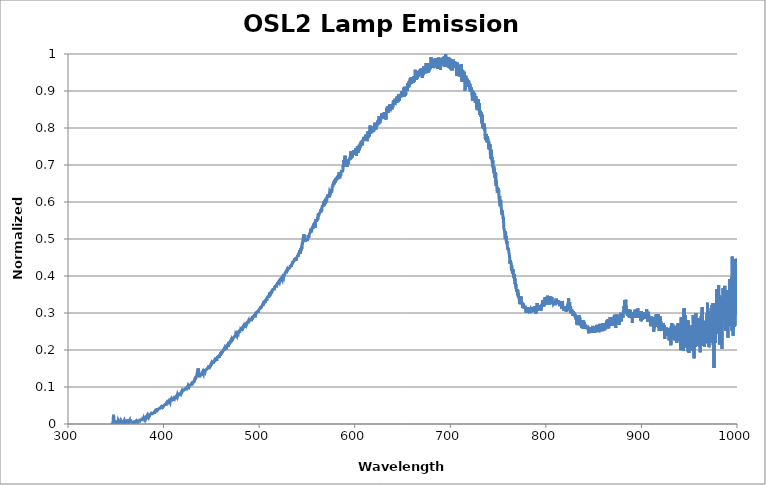
| Category | OSL2 Lamp Emission Spectrum |
|---|---|
| 344.85 | 0 |
| 345.06 | 0 |
| 345.28 | 0 |
| 345.49 | 0 |
| 345.71 | 0 |
| 345.92 | 0 |
| 346.14 | 0 |
| 346.35 | 0 |
| 346.56 | 0 |
| 346.78 | 0 |
| 346.99 | 0 |
| 347.21 | 0 |
| 347.42 | 0 |
| 347.64 | 0.025 |
| 347.85 | 0.026 |
| 348.07 | 0.007 |
| 348.28 | 0.004 |
| 348.49 | 0.01 |
| 348.71 | 0.001 |
| 348.92 | 0.003 |
| 349.14 | 0.003 |
| 349.35 | 0.007 |
| 349.57 | 0.002 |
| 349.78 | 0.006 |
| 350.0 | 0.005 |
| 350.21 | 0.002 |
| 350.42 | 0.007 |
| 350.64 | 0.005 |
| 350.85 | 0.003 |
| 351.07 | 0 |
| 351.28 | 0.006 |
| 351.5 | 0.008 |
| 351.71 | 0.008 |
| 351.93 | 0.007 |
| 352.14 | 0.005 |
| 352.35 | 0.005 |
| 352.57 | 0.009 |
| 352.78 | 0.008 |
| 353.0 | 0.01 |
| 353.21 | 0.009 |
| 353.43 | 0.004 |
| 353.64 | 0.009 |
| 353.85 | 0.007 |
| 354.07 | 0.006 |
| 354.28 | 0.005 |
| 354.5 | 0.005 |
| 354.71 | 0.009 |
| 354.93 | 0.007 |
| 355.14 | 0.006 |
| 355.35 | 0.006 |
| 355.57 | 0.002 |
| 355.78 | 0.006 |
| 356.0 | 0.008 |
| 356.21 | 0.006 |
| 356.42 | 0.003 |
| 356.64 | 0.005 |
| 356.85 | 0.006 |
| 357.07 | 0.006 |
| 357.28 | 0.006 |
| 357.5 | 0.006 |
| 357.71 | 0.004 |
| 357.92 | 0.005 |
| 358.14 | 0.004 |
| 358.35 | 0.006 |
| 358.57 | 0.003 |
| 358.78 | 0.007 |
| 358.99 | 0.01 |
| 359.21 | 0.008 |
| 359.42 | 0.01 |
| 359.64 | 0.005 |
| 359.85 | 0.003 |
| 360.06 | 0.006 |
| 360.28 | 0.004 |
| 360.49 | 0.001 |
| 360.71 | 0.002 |
| 360.92 | 0.004 |
| 361.13 | 0.004 |
| 361.35 | 0.007 |
| 361.56 | 0.002 |
| 361.78 | 0.009 |
| 361.99 | 0.011 |
| 362.2 | 0.005 |
| 362.42 | 0.012 |
| 362.63 | 0.001 |
| 362.85 | 0.009 |
| 363.06 | 0.006 |
| 363.27 | 0.009 |
| 363.49 | 0.006 |
| 363.7 | 0.007 |
| 363.92 | 0.006 |
| 364.13 | 0.005 |
| 364.34 | 0.01 |
| 364.56 | 0.003 |
| 364.77 | 0.007 |
| 364.98 | 0.007 |
| 365.2 | 0.006 |
| 365.41 | 0.005 |
| 365.63 | 0.008 |
| 365.84 | 0.008 |
| 366.05 | 0.006 |
| 366.27 | 0.006 |
| 366.48 | 0.003 |
| 366.69 | 0.007 |
| 366.91 | 0.006 |
| 367.12 | 0.004 |
| 367.34 | 0.003 |
| 367.55 | 0.003 |
| 367.76 | 0.006 |
| 367.98 | 0.004 |
| 368.19 | 0.004 |
| 368.4 | 0.008 |
| 368.62 | 0.001 |
| 368.83 | 0.005 |
| 369.04 | 0.006 |
| 369.26 | 0.005 |
| 369.47 | 0.003 |
| 369.69 | 0.003 |
| 369.9 | 0.006 |
| 370.11 | 0.008 |
| 370.33 | 0.01 |
| 370.54 | 0.006 |
| 370.75 | 0.004 |
| 370.97 | 0.005 |
| 371.18 | 0.008 |
| 371.39 | 0.003 |
| 371.61 | 0.009 |
| 371.82 | 0.007 |
| 372.04 | 0.009 |
| 372.25 | 0.008 |
| 372.46 | 0.008 |
| 372.68 | 0.005 |
| 372.89 | 0.008 |
| 373.1 | 0.009 |
| 373.32 | 0.008 |
| 373.53 | 0.008 |
| 373.74 | 0.009 |
| 373.96 | 0.008 |
| 374.17 | 0.01 |
| 374.38 | 0.009 |
| 374.6 | 0.008 |
| 374.81 | 0.009 |
| 375.02 | 0.008 |
| 375.24 | 0.011 |
| 375.45 | 0.01 |
| 375.66 | 0.009 |
| 375.88 | 0.009 |
| 376.09 | 0.011 |
| 376.3 | 0.011 |
| 376.52 | 0.009 |
| 376.73 | 0.011 |
| 376.94 | 0.011 |
| 377.16 | 0.01 |
| 377.37 | 0.012 |
| 377.58 | 0.008 |
| 377.8 | 0.011 |
| 378.01 | 0.012 |
| 378.22 | 0.015 |
| 378.44 | 0.015 |
| 378.65 | 0.013 |
| 378.86 | 0.012 |
| 379.08 | 0.015 |
| 379.29 | 0.013 |
| 379.5 | 0.016 |
| 379.72 | 0.016 |
| 379.93 | 0.014 |
| 380.14 | 0.013 |
| 380.36 | 0.018 |
| 380.57 | 0.015 |
| 380.78 | 0.015 |
| 380.99 | 0.017 |
| 381.21 | 0.015 |
| 381.42 | 0.018 |
| 381.63 | 0.019 |
| 381.85 | 0.018 |
| 382.06 | 0.017 |
| 382.27 | 0.02 |
| 382.49 | 0.022 |
| 382.7 | 0.018 |
| 382.91 | 0.016 |
| 383.13 | 0.018 |
| 383.34 | 0.018 |
| 383.55 | 0.021 |
| 383.76 | 0.023 |
| 383.98 | 0.025 |
| 384.19 | 0.021 |
| 384.4 | 0.019 |
| 384.62 | 0.019 |
| 384.83 | 0.022 |
| 385.04 | 0.019 |
| 385.26 | 0.023 |
| 385.47 | 0.025 |
| 385.68 | 0.025 |
| 385.89 | 0.025 |
| 386.11 | 0.026 |
| 386.32 | 0.025 |
| 386.53 | 0.023 |
| 386.75 | 0.025 |
| 386.96 | 0.025 |
| 387.17 | 0.029 |
| 387.38 | 0.027 |
| 387.6 | 0.031 |
| 387.81 | 0.029 |
| 388.02 | 0.029 |
| 388.24 | 0.028 |
| 388.45 | 0.03 |
| 388.66 | 0.03 |
| 388.87 | 0.03 |
| 389.09 | 0.028 |
| 389.3 | 0.029 |
| 389.51 | 0.031 |
| 389.73 | 0.03 |
| 389.94 | 0.031 |
| 390.15 | 0.031 |
| 390.36 | 0.033 |
| 390.58 | 0.028 |
| 390.79 | 0.032 |
| 391.0 | 0.034 |
| 391.21 | 0.034 |
| 391.43 | 0.031 |
| 391.64 | 0.034 |
| 391.85 | 0.035 |
| 392.07 | 0.035 |
| 392.28 | 0.036 |
| 392.49 | 0.037 |
| 392.7 | 0.036 |
| 392.92 | 0.035 |
| 393.13 | 0.039 |
| 393.34 | 0.039 |
| 393.55 | 0.038 |
| 393.77 | 0.037 |
| 393.98 | 0.037 |
| 394.19 | 0.039 |
| 394.4 | 0.038 |
| 394.62 | 0.039 |
| 394.83 | 0.039 |
| 395.04 | 0.039 |
| 395.25 | 0.042 |
| 395.47 | 0.042 |
| 395.68 | 0.042 |
| 395.89 | 0.043 |
| 396.1 | 0.043 |
| 396.32 | 0.042 |
| 396.53 | 0.043 |
| 396.74 | 0.043 |
| 396.95 | 0.043 |
| 397.17 | 0.046 |
| 397.38 | 0.045 |
| 397.59 | 0.046 |
| 397.8 | 0.046 |
| 398.02 | 0.043 |
| 398.23 | 0.044 |
| 398.44 | 0.047 |
| 398.65 | 0.045 |
| 398.87 | 0.046 |
| 399.08 | 0.047 |
| 399.29 | 0.046 |
| 399.5 | 0.046 |
| 399.71 | 0.048 |
| 399.93 | 0.047 |
| 400.14 | 0.049 |
| 400.35 | 0.049 |
| 400.56 | 0.05 |
| 400.78 | 0.05 |
| 400.99 | 0.051 |
| 401.2 | 0.052 |
| 401.41 | 0.052 |
| 401.63 | 0.052 |
| 401.84 | 0.053 |
| 402.05 | 0.053 |
| 402.26 | 0.052 |
| 402.47 | 0.052 |
| 402.69 | 0.052 |
| 402.9 | 0.057 |
| 403.11 | 0.055 |
| 403.32 | 0.056 |
| 403.53 | 0.056 |
| 403.75 | 0.057 |
| 403.96 | 0.059 |
| 404.17 | 0.06 |
| 404.38 | 0.06 |
| 404.6 | 0.059 |
| 404.81 | 0.065 |
| 405.02 | 0.06 |
| 405.23 | 0.062 |
| 405.44 | 0.062 |
| 405.66 | 0.063 |
| 405.87 | 0.062 |
| 406.08 | 0.062 |
| 406.29 | 0.06 |
| 406.5 | 0.062 |
| 406.72 | 0.058 |
| 406.93 | 0.062 |
| 407.14 | 0.064 |
| 407.35 | 0.062 |
| 407.56 | 0.066 |
| 407.78 | 0.061 |
| 407.99 | 0.062 |
| 408.2 | 0.064 |
| 408.41 | 0.064 |
| 408.62 | 0.064 |
| 408.84 | 0.066 |
| 409.05 | 0.066 |
| 409.26 | 0.066 |
| 409.47 | 0.065 |
| 409.68 | 0.067 |
| 409.89 | 0.066 |
| 410.11 | 0.069 |
| 410.32 | 0.07 |
| 410.53 | 0.069 |
| 410.74 | 0.069 |
| 410.95 | 0.068 |
| 411.17 | 0.067 |
| 411.38 | 0.069 |
| 411.59 | 0.072 |
| 411.8 | 0.069 |
| 412.01 | 0.069 |
| 412.22 | 0.072 |
| 412.44 | 0.073 |
| 412.65 | 0.071 |
| 412.86 | 0.073 |
| 413.07 | 0.072 |
| 413.28 | 0.075 |
| 413.49 | 0.078 |
| 413.71 | 0.073 |
| 413.92 | 0.074 |
| 414.13 | 0.076 |
| 414.34 | 0.079 |
| 414.55 | 0.077 |
| 414.76 | 0.075 |
| 414.98 | 0.077 |
| 415.19 | 0.078 |
| 415.4 | 0.08 |
| 415.61 | 0.079 |
| 415.82 | 0.077 |
| 416.03 | 0.081 |
| 416.25 | 0.08 |
| 416.46 | 0.081 |
| 416.67 | 0.08 |
| 416.88 | 0.081 |
| 417.09 | 0.08 |
| 417.3 | 0.084 |
| 417.52 | 0.08 |
| 417.73 | 0.082 |
| 417.94 | 0.083 |
| 418.15 | 0.085 |
| 418.36 | 0.083 |
| 418.57 | 0.083 |
| 418.78 | 0.088 |
| 419.0 | 0.085 |
| 419.21 | 0.085 |
| 419.42 | 0.087 |
| 419.63 | 0.088 |
| 419.84 | 0.089 |
| 420.05 | 0.087 |
| 420.26 | 0.092 |
| 420.48 | 0.091 |
| 420.69 | 0.091 |
| 420.9 | 0.091 |
| 421.11 | 0.091 |
| 421.32 | 0.091 |
| 421.53 | 0.092 |
| 421.74 | 0.091 |
| 421.95 | 0.092 |
| 422.17 | 0.094 |
| 422.38 | 0.094 |
| 422.59 | 0.095 |
| 422.8 | 0.094 |
| 423.01 | 0.093 |
| 423.22 | 0.095 |
| 423.43 | 0.096 |
| 423.64 | 0.091 |
| 423.86 | 0.096 |
| 424.07 | 0.096 |
| 424.28 | 0.094 |
| 424.49 | 0.099 |
| 424.7 | 0.099 |
| 424.91 | 0.099 |
| 425.12 | 0.098 |
| 425.33 | 0.1 |
| 425.55 | 0.098 |
| 425.76 | 0.101 |
| 425.97 | 0.104 |
| 426.18 | 0.101 |
| 426.39 | 0.103 |
| 426.6 | 0.101 |
| 426.81 | 0.103 |
| 427.02 | 0.104 |
| 427.23 | 0.103 |
| 427.45 | 0.103 |
| 427.66 | 0.105 |
| 427.87 | 0.105 |
| 428.08 | 0.105 |
| 428.29 | 0.106 |
| 428.5 | 0.105 |
| 428.71 | 0.104 |
| 428.92 | 0.108 |
| 429.13 | 0.107 |
| 429.34 | 0.106 |
| 429.56 | 0.104 |
| 429.77 | 0.109 |
| 429.98 | 0.111 |
| 430.19 | 0.112 |
| 430.4 | 0.11 |
| 430.61 | 0.114 |
| 430.82 | 0.109 |
| 431.03 | 0.109 |
| 431.24 | 0.113 |
| 431.45 | 0.112 |
| 431.66 | 0.114 |
| 431.87 | 0.117 |
| 432.09 | 0.113 |
| 432.3 | 0.113 |
| 432.51 | 0.119 |
| 432.72 | 0.117 |
| 432.93 | 0.117 |
| 433.14 | 0.118 |
| 433.35 | 0.118 |
| 433.56 | 0.122 |
| 433.77 | 0.12 |
| 433.98 | 0.124 |
| 434.19 | 0.126 |
| 434.4 | 0.127 |
| 434.61 | 0.127 |
| 434.83 | 0.134 |
| 435.04 | 0.134 |
| 435.25 | 0.137 |
| 435.46 | 0.144 |
| 435.67 | 0.142 |
| 435.88 | 0.147 |
| 436.09 | 0.15 |
| 436.3 | 0.152 |
| 436.51 | 0.147 |
| 436.72 | 0.147 |
| 436.93 | 0.14 |
| 437.14 | 0.141 |
| 437.35 | 0.132 |
| 437.56 | 0.129 |
| 437.77 | 0.126 |
| 437.98 | 0.131 |
| 438.2 | 0.129 |
| 438.41 | 0.132 |
| 438.62 | 0.13 |
| 438.83 | 0.133 |
| 439.04 | 0.133 |
| 439.25 | 0.131 |
| 439.46 | 0.134 |
| 439.67 | 0.135 |
| 439.88 | 0.132 |
| 440.09 | 0.137 |
| 440.3 | 0.13 |
| 440.51 | 0.135 |
| 440.72 | 0.135 |
| 440.93 | 0.139 |
| 441.14 | 0.139 |
| 441.35 | 0.137 |
| 441.56 | 0.135 |
| 441.77 | 0.14 |
| 441.98 | 0.137 |
| 442.19 | 0.137 |
| 442.4 | 0.142 |
| 442.61 | 0.14 |
| 442.82 | 0.14 |
| 443.03 | 0.144 |
| 443.25 | 0.139 |
| 443.46 | 0.143 |
| 443.67 | 0.144 |
| 443.88 | 0.141 |
| 444.09 | 0.146 |
| 444.3 | 0.146 |
| 444.51 | 0.149 |
| 444.72 | 0.149 |
| 444.93 | 0.146 |
| 445.14 | 0.148 |
| 445.35 | 0.147 |
| 445.56 | 0.147 |
| 445.77 | 0.147 |
| 445.98 | 0.149 |
| 446.19 | 0.151 |
| 446.4 | 0.149 |
| 446.61 | 0.148 |
| 446.82 | 0.153 |
| 447.03 | 0.152 |
| 447.24 | 0.153 |
| 447.45 | 0.153 |
| 447.66 | 0.154 |
| 447.87 | 0.152 |
| 448.08 | 0.155 |
| 448.29 | 0.157 |
| 448.5 | 0.158 |
| 448.71 | 0.156 |
| 448.92 | 0.158 |
| 449.13 | 0.156 |
| 449.34 | 0.158 |
| 449.55 | 0.157 |
| 449.76 | 0.163 |
| 449.97 | 0.16 |
| 450.18 | 0.163 |
| 450.39 | 0.161 |
| 450.6 | 0.159 |
| 450.81 | 0.164 |
| 451.02 | 0.165 |
| 451.23 | 0.163 |
| 451.44 | 0.168 |
| 451.65 | 0.165 |
| 451.86 | 0.168 |
| 452.07 | 0.168 |
| 452.28 | 0.168 |
| 452.49 | 0.167 |
| 452.7 | 0.166 |
| 452.91 | 0.166 |
| 453.12 | 0.171 |
| 453.33 | 0.171 |
| 453.54 | 0.168 |
| 453.75 | 0.171 |
| 453.96 | 0.171 |
| 454.17 | 0.175 |
| 454.38 | 0.172 |
| 454.59 | 0.176 |
| 454.79 | 0.172 |
| 455.0 | 0.173 |
| 455.21 | 0.177 |
| 455.42 | 0.174 |
| 455.63 | 0.171 |
| 455.84 | 0.177 |
| 456.05 | 0.175 |
| 456.26 | 0.179 |
| 456.47 | 0.179 |
| 456.68 | 0.181 |
| 456.89 | 0.183 |
| 457.1 | 0.181 |
| 457.31 | 0.181 |
| 457.52 | 0.182 |
| 457.73 | 0.182 |
| 457.94 | 0.182 |
| 458.15 | 0.185 |
| 458.36 | 0.18 |
| 458.57 | 0.182 |
| 458.78 | 0.186 |
| 458.99 | 0.189 |
| 459.2 | 0.189 |
| 459.41 | 0.184 |
| 459.62 | 0.189 |
| 459.83 | 0.194 |
| 460.03 | 0.188 |
| 460.24 | 0.192 |
| 460.45 | 0.191 |
| 460.66 | 0.19 |
| 460.87 | 0.197 |
| 461.08 | 0.191 |
| 461.29 | 0.197 |
| 461.5 | 0.198 |
| 461.71 | 0.194 |
| 461.92 | 0.197 |
| 462.13 | 0.196 |
| 462.34 | 0.196 |
| 462.55 | 0.197 |
| 462.76 | 0.199 |
| 462.97 | 0.202 |
| 463.18 | 0.198 |
| 463.38 | 0.201 |
| 463.59 | 0.203 |
| 463.8 | 0.201 |
| 464.01 | 0.202 |
| 464.22 | 0.208 |
| 464.43 | 0.201 |
| 464.64 | 0.2 |
| 464.85 | 0.209 |
| 465.06 | 0.208 |
| 465.27 | 0.211 |
| 465.48 | 0.207 |
| 465.69 | 0.209 |
| 465.89 | 0.207 |
| 466.1 | 0.207 |
| 466.31 | 0.208 |
| 466.52 | 0.209 |
| 466.73 | 0.213 |
| 466.94 | 0.211 |
| 467.15 | 0.214 |
| 467.36 | 0.212 |
| 467.57 | 0.214 |
| 467.78 | 0.212 |
| 467.99 | 0.209 |
| 468.19 | 0.221 |
| 468.4 | 0.217 |
| 468.61 | 0.214 |
| 468.82 | 0.222 |
| 469.03 | 0.223 |
| 469.24 | 0.218 |
| 469.45 | 0.219 |
| 469.66 | 0.223 |
| 469.87 | 0.223 |
| 470.08 | 0.222 |
| 470.28 | 0.223 |
| 470.49 | 0.223 |
| 470.7 | 0.221 |
| 470.91 | 0.229 |
| 471.12 | 0.228 |
| 471.33 | 0.225 |
| 471.54 | 0.224 |
| 471.75 | 0.227 |
| 471.96 | 0.227 |
| 472.16 | 0.226 |
| 472.37 | 0.228 |
| 472.58 | 0.232 |
| 472.79 | 0.232 |
| 473.0 | 0.229 |
| 473.21 | 0.234 |
| 473.42 | 0.232 |
| 473.63 | 0.234 |
| 473.84 | 0.235 |
| 474.04 | 0.236 |
| 474.25 | 0.237 |
| 474.46 | 0.234 |
| 474.67 | 0.238 |
| 474.88 | 0.237 |
| 475.09 | 0.239 |
| 475.3 | 0.239 |
| 475.5 | 0.243 |
| 475.71 | 0.243 |
| 475.92 | 0.244 |
| 476.13 | 0.241 |
| 476.34 | 0.241 |
| 476.55 | 0.238 |
| 476.76 | 0.243 |
| 476.96 | 0.24 |
| 477.17 | 0.246 |
| 477.38 | 0.245 |
| 477.59 | 0.247 |
| 477.8 | 0.247 |
| 478.01 | 0.244 |
| 478.22 | 0.249 |
| 478.42 | 0.245 |
| 478.63 | 0.248 |
| 478.84 | 0.249 |
| 479.05 | 0.251 |
| 479.26 | 0.25 |
| 479.47 | 0.248 |
| 479.68 | 0.249 |
| 479.88 | 0.255 |
| 480.09 | 0.252 |
| 480.3 | 0.255 |
| 480.51 | 0.256 |
| 480.72 | 0.252 |
| 480.93 | 0.258 |
| 481.13 | 0.256 |
| 481.34 | 0.256 |
| 481.55 | 0.256 |
| 481.76 | 0.26 |
| 481.97 | 0.256 |
| 482.18 | 0.256 |
| 482.38 | 0.26 |
| 482.59 | 0.259 |
| 482.8 | 0.259 |
| 483.01 | 0.261 |
| 483.22 | 0.264 |
| 483.43 | 0.26 |
| 483.63 | 0.263 |
| 483.84 | 0.26 |
| 484.05 | 0.264 |
| 484.26 | 0.26 |
| 484.47 | 0.265 |
| 484.68 | 0.262 |
| 484.88 | 0.265 |
| 485.09 | 0.268 |
| 485.3 | 0.267 |
| 485.51 | 0.268 |
| 485.72 | 0.269 |
| 485.92 | 0.267 |
| 486.13 | 0.269 |
| 486.34 | 0.272 |
| 486.55 | 0.269 |
| 486.76 | 0.268 |
| 486.96 | 0.27 |
| 487.17 | 0.269 |
| 487.38 | 0.269 |
| 487.59 | 0.273 |
| 487.8 | 0.273 |
| 488.0 | 0.274 |
| 488.21 | 0.275 |
| 488.42 | 0.276 |
| 488.63 | 0.278 |
| 488.84 | 0.273 |
| 489.04 | 0.276 |
| 489.25 | 0.275 |
| 489.46 | 0.276 |
| 489.67 | 0.276 |
| 489.88 | 0.279 |
| 490.08 | 0.278 |
| 490.29 | 0.279 |
| 490.5 | 0.281 |
| 490.71 | 0.281 |
| 490.92 | 0.282 |
| 491.12 | 0.284 |
| 491.33 | 0.281 |
| 491.54 | 0.282 |
| 491.75 | 0.283 |
| 491.95 | 0.283 |
| 492.16 | 0.282 |
| 492.37 | 0.287 |
| 492.58 | 0.282 |
| 492.79 | 0.288 |
| 492.99 | 0.287 |
| 493.2 | 0.287 |
| 493.41 | 0.287 |
| 493.62 | 0.29 |
| 493.82 | 0.288 |
| 494.03 | 0.289 |
| 494.24 | 0.291 |
| 494.45 | 0.293 |
| 494.65 | 0.289 |
| 494.86 | 0.293 |
| 495.07 | 0.292 |
| 495.28 | 0.295 |
| 495.49 | 0.294 |
| 495.69 | 0.295 |
| 495.9 | 0.295 |
| 496.11 | 0.292 |
| 496.32 | 0.298 |
| 496.52 | 0.298 |
| 496.73 | 0.296 |
| 496.94 | 0.303 |
| 497.15 | 0.297 |
| 497.35 | 0.3 |
| 497.56 | 0.3 |
| 497.77 | 0.304 |
| 497.98 | 0.301 |
| 498.18 | 0.301 |
| 498.39 | 0.305 |
| 498.6 | 0.304 |
| 498.81 | 0.301 |
| 499.01 | 0.305 |
| 499.22 | 0.304 |
| 499.43 | 0.306 |
| 499.64 | 0.308 |
| 499.84 | 0.308 |
| 500.05 | 0.307 |
| 500.26 | 0.31 |
| 500.46 | 0.31 |
| 500.67 | 0.31 |
| 500.88 | 0.31 |
| 501.09 | 0.312 |
| 501.29 | 0.312 |
| 501.5 | 0.313 |
| 501.71 | 0.318 |
| 501.92 | 0.313 |
| 502.12 | 0.316 |
| 502.33 | 0.318 |
| 502.54 | 0.317 |
| 502.74 | 0.318 |
| 502.95 | 0.317 |
| 503.16 | 0.32 |
| 503.37 | 0.322 |
| 503.57 | 0.321 |
| 503.78 | 0.323 |
| 503.99 | 0.324 |
| 504.19 | 0.32 |
| 504.4 | 0.325 |
| 504.61 | 0.324 |
| 504.82 | 0.33 |
| 505.02 | 0.328 |
| 505.23 | 0.326 |
| 505.44 | 0.332 |
| 505.64 | 0.328 |
| 505.85 | 0.329 |
| 506.06 | 0.334 |
| 506.27 | 0.328 |
| 506.47 | 0.33 |
| 506.68 | 0.333 |
| 506.89 | 0.334 |
| 507.09 | 0.333 |
| 507.3 | 0.335 |
| 507.51 | 0.335 |
| 507.71 | 0.34 |
| 507.92 | 0.334 |
| 508.13 | 0.337 |
| 508.33 | 0.34 |
| 508.54 | 0.342 |
| 508.75 | 0.341 |
| 508.96 | 0.344 |
| 509.16 | 0.342 |
| 509.37 | 0.344 |
| 509.58 | 0.346 |
| 509.78 | 0.346 |
| 509.99 | 0.344 |
| 510.2 | 0.344 |
| 510.4 | 0.349 |
| 510.61 | 0.345 |
| 510.82 | 0.347 |
| 511.02 | 0.355 |
| 511.23 | 0.353 |
| 511.44 | 0.349 |
| 511.64 | 0.35 |
| 511.85 | 0.354 |
| 512.06 | 0.353 |
| 512.26 | 0.356 |
| 512.47 | 0.356 |
| 512.68 | 0.358 |
| 512.88 | 0.354 |
| 513.09 | 0.357 |
| 513.3 | 0.352 |
| 513.5 | 0.357 |
| 513.71 | 0.361 |
| 513.92 | 0.361 |
| 514.12 | 0.363 |
| 514.33 | 0.361 |
| 514.54 | 0.361 |
| 514.74 | 0.364 |
| 514.95 | 0.364 |
| 515.16 | 0.363 |
| 515.36 | 0.366 |
| 515.57 | 0.362 |
| 515.78 | 0.365 |
| 515.98 | 0.365 |
| 516.19 | 0.37 |
| 516.4 | 0.369 |
| 516.6 | 0.37 |
| 516.81 | 0.369 |
| 517.01 | 0.372 |
| 517.22 | 0.371 |
| 517.43 | 0.374 |
| 517.63 | 0.375 |
| 517.84 | 0.371 |
| 518.05 | 0.369 |
| 518.25 | 0.374 |
| 518.46 | 0.374 |
| 518.67 | 0.377 |
| 518.87 | 0.377 |
| 519.08 | 0.379 |
| 519.28 | 0.379 |
| 519.49 | 0.382 |
| 519.7 | 0.376 |
| 519.9 | 0.383 |
| 520.11 | 0.381 |
| 520.32 | 0.382 |
| 520.52 | 0.383 |
| 520.73 | 0.381 |
| 520.93 | 0.383 |
| 521.14 | 0.388 |
| 521.35 | 0.386 |
| 521.55 | 0.385 |
| 521.76 | 0.387 |
| 521.96 | 0.389 |
| 522.17 | 0.388 |
| 522.38 | 0.388 |
| 522.58 | 0.387 |
| 522.79 | 0.39 |
| 523.0 | 0.388 |
| 523.2 | 0.394 |
| 523.41 | 0.396 |
| 523.61 | 0.392 |
| 523.82 | 0.395 |
| 524.03 | 0.39 |
| 524.23 | 0.396 |
| 524.44 | 0.396 |
| 524.64 | 0.398 |
| 524.85 | 0.4 |
| 525.06 | 0.4 |
| 525.26 | 0.398 |
| 525.47 | 0.395 |
| 525.67 | 0.399 |
| 525.88 | 0.403 |
| 526.09 | 0.4 |
| 526.29 | 0.402 |
| 526.5 | 0.401 |
| 526.7 | 0.403 |
| 526.91 | 0.402 |
| 527.11 | 0.408 |
| 527.32 | 0.409 |
| 527.53 | 0.406 |
| 527.73 | 0.409 |
| 527.94 | 0.41 |
| 528.14 | 0.406 |
| 528.35 | 0.413 |
| 528.56 | 0.414 |
| 528.76 | 0.414 |
| 528.97 | 0.413 |
| 529.17 | 0.417 |
| 529.38 | 0.418 |
| 529.58 | 0.413 |
| 529.79 | 0.422 |
| 530.0 | 0.417 |
| 530.2 | 0.416 |
| 530.41 | 0.417 |
| 530.61 | 0.42 |
| 530.82 | 0.422 |
| 531.02 | 0.419 |
| 531.23 | 0.419 |
| 531.43 | 0.419 |
| 531.64 | 0.422 |
| 531.85 | 0.422 |
| 532.05 | 0.423 |
| 532.26 | 0.421 |
| 532.46 | 0.424 |
| 532.67 | 0.43 |
| 532.87 | 0.425 |
| 533.08 | 0.426 |
| 533.28 | 0.429 |
| 533.49 | 0.425 |
| 533.7 | 0.427 |
| 533.9 | 0.431 |
| 534.11 | 0.434 |
| 534.31 | 0.431 |
| 534.52 | 0.432 |
| 534.72 | 0.43 |
| 534.93 | 0.435 |
| 535.13 | 0.433 |
| 535.34 | 0.441 |
| 535.54 | 0.437 |
| 535.75 | 0.435 |
| 535.95 | 0.436 |
| 536.16 | 0.437 |
| 536.37 | 0.44 |
| 536.57 | 0.438 |
| 536.78 | 0.442 |
| 536.98 | 0.445 |
| 537.19 | 0.441 |
| 537.39 | 0.448 |
| 537.6 | 0.442 |
| 537.8 | 0.442 |
| 538.01 | 0.443 |
| 538.21 | 0.446 |
| 538.42 | 0.441 |
| 538.62 | 0.45 |
| 538.83 | 0.448 |
| 539.03 | 0.445 |
| 539.24 | 0.449 |
| 539.44 | 0.451 |
| 539.65 | 0.45 |
| 539.85 | 0.453 |
| 540.06 | 0.454 |
| 540.26 | 0.454 |
| 540.47 | 0.452 |
| 540.67 | 0.456 |
| 540.88 | 0.452 |
| 541.08 | 0.457 |
| 541.29 | 0.455 |
| 541.49 | 0.46 |
| 541.7 | 0.461 |
| 541.9 | 0.462 |
| 542.11 | 0.459 |
| 542.31 | 0.463 |
| 542.52 | 0.464 |
| 542.72 | 0.47 |
| 542.93 | 0.46 |
| 543.13 | 0.468 |
| 543.34 | 0.465 |
| 543.54 | 0.465 |
| 543.75 | 0.475 |
| 543.95 | 0.475 |
| 544.16 | 0.47 |
| 544.36 | 0.48 |
| 544.57 | 0.474 |
| 544.77 | 0.482 |
| 544.98 | 0.484 |
| 545.18 | 0.49 |
| 545.39 | 0.486 |
| 545.59 | 0.493 |
| 545.8 | 0.495 |
| 546.0 | 0.5 |
| 546.21 | 0.505 |
| 546.41 | 0.502 |
| 546.62 | 0.503 |
| 546.82 | 0.512 |
| 547.03 | 0.511 |
| 547.23 | 0.511 |
| 547.43 | 0.511 |
| 547.64 | 0.503 |
| 547.84 | 0.501 |
| 548.05 | 0.5 |
| 548.25 | 0.493 |
| 548.46 | 0.497 |
| 548.66 | 0.494 |
| 548.87 | 0.497 |
| 549.07 | 0.495 |
| 549.28 | 0.5 |
| 549.48 | 0.496 |
| 549.68 | 0.497 |
| 549.89 | 0.497 |
| 550.09 | 0.501 |
| 550.3 | 0.5 |
| 550.5 | 0.495 |
| 550.71 | 0.494 |
| 550.91 | 0.502 |
| 551.12 | 0.504 |
| 551.32 | 0.51 |
| 551.53 | 0.507 |
| 551.73 | 0.505 |
| 551.93 | 0.503 |
| 552.14 | 0.509 |
| 552.34 | 0.507 |
| 552.55 | 0.513 |
| 552.75 | 0.511 |
| 552.96 | 0.515 |
| 553.16 | 0.512 |
| 553.36 | 0.516 |
| 553.57 | 0.513 |
| 553.77 | 0.519 |
| 553.98 | 0.528 |
| 554.18 | 0.522 |
| 554.39 | 0.525 |
| 554.59 | 0.522 |
| 554.79 | 0.518 |
| 555.0 | 0.523 |
| 555.2 | 0.526 |
| 555.41 | 0.53 |
| 555.61 | 0.531 |
| 555.82 | 0.53 |
| 556.02 | 0.529 |
| 556.22 | 0.534 |
| 556.43 | 0.528 |
| 556.63 | 0.53 |
| 556.84 | 0.537 |
| 557.04 | 0.538 |
| 557.24 | 0.54 |
| 557.45 | 0.534 |
| 557.65 | 0.533 |
| 557.86 | 0.543 |
| 558.06 | 0.536 |
| 558.26 | 0.545 |
| 558.47 | 0.531 |
| 558.67 | 0.538 |
| 558.88 | 0.544 |
| 559.08 | 0.547 |
| 559.28 | 0.548 |
| 559.49 | 0.553 |
| 559.69 | 0.549 |
| 559.9 | 0.552 |
| 560.1 | 0.548 |
| 560.3 | 0.549 |
| 560.51 | 0.55 |
| 560.71 | 0.55 |
| 560.92 | 0.553 |
| 561.12 | 0.558 |
| 561.32 | 0.553 |
| 561.53 | 0.561 |
| 561.73 | 0.563 |
| 561.93 | 0.569 |
| 562.14 | 0.56 |
| 562.34 | 0.564 |
| 562.55 | 0.565 |
| 562.75 | 0.565 |
| 562.95 | 0.566 |
| 563.16 | 0.565 |
| 563.36 | 0.567 |
| 563.56 | 0.572 |
| 563.77 | 0.57 |
| 563.97 | 0.573 |
| 564.17 | 0.569 |
| 564.38 | 0.576 |
| 564.58 | 0.572 |
| 564.79 | 0.58 |
| 564.99 | 0.577 |
| 565.19 | 0.582 |
| 565.4 | 0.576 |
| 565.6 | 0.582 |
| 565.8 | 0.583 |
| 566.01 | 0.589 |
| 566.21 | 0.589 |
| 566.41 | 0.586 |
| 566.62 | 0.589 |
| 566.82 | 0.589 |
| 567.02 | 0.587 |
| 567.23 | 0.59 |
| 567.43 | 0.589 |
| 567.64 | 0.601 |
| 567.84 | 0.59 |
| 568.04 | 0.6 |
| 568.25 | 0.598 |
| 568.45 | 0.597 |
| 568.65 | 0.603 |
| 568.86 | 0.6 |
| 569.06 | 0.596 |
| 569.26 | 0.605 |
| 569.47 | 0.595 |
| 569.67 | 0.604 |
| 569.87 | 0.599 |
| 570.08 | 0.599 |
| 570.28 | 0.601 |
| 570.48 | 0.602 |
| 570.69 | 0.603 |
| 570.89 | 0.604 |
| 571.09 | 0.613 |
| 571.29 | 0.613 |
| 571.5 | 0.615 |
| 571.7 | 0.616 |
| 571.9 | 0.62 |
| 572.11 | 0.613 |
| 572.31 | 0.612 |
| 572.51 | 0.62 |
| 572.72 | 0.616 |
| 572.92 | 0.613 |
| 573.12 | 0.616 |
| 573.33 | 0.614 |
| 573.53 | 0.623 |
| 573.73 | 0.627 |
| 573.94 | 0.626 |
| 574.14 | 0.627 |
| 574.34 | 0.626 |
| 574.54 | 0.622 |
| 574.75 | 0.623 |
| 574.95 | 0.621 |
| 575.15 | 0.625 |
| 575.36 | 0.63 |
| 575.56 | 0.633 |
| 575.76 | 0.625 |
| 575.97 | 0.622 |
| 576.17 | 0.634 |
| 576.37 | 0.633 |
| 576.57 | 0.643 |
| 576.78 | 0.641 |
| 576.98 | 0.64 |
| 577.18 | 0.64 |
| 577.39 | 0.648 |
| 577.59 | 0.646 |
| 577.79 | 0.653 |
| 577.99 | 0.649 |
| 578.2 | 0.65 |
| 578.4 | 0.648 |
| 578.6 | 0.656 |
| 578.8 | 0.648 |
| 579.01 | 0.659 |
| 579.21 | 0.651 |
| 579.41 | 0.66 |
| 579.62 | 0.654 |
| 579.82 | 0.665 |
| 580.02 | 0.659 |
| 580.22 | 0.656 |
| 580.43 | 0.658 |
| 580.63 | 0.661 |
| 580.83 | 0.661 |
| 581.03 | 0.664 |
| 581.24 | 0.662 |
| 581.44 | 0.667 |
| 581.64 | 0.665 |
| 581.84 | 0.668 |
| 582.05 | 0.662 |
| 582.25 | 0.67 |
| 582.45 | 0.662 |
| 582.65 | 0.668 |
| 582.86 | 0.665 |
| 583.06 | 0.669 |
| 583.26 | 0.669 |
| 583.46 | 0.674 |
| 583.67 | 0.667 |
| 583.87 | 0.681 |
| 584.07 | 0.668 |
| 584.27 | 0.664 |
| 584.48 | 0.666 |
| 584.68 | 0.665 |
| 584.88 | 0.674 |
| 585.08 | 0.68 |
| 585.29 | 0.671 |
| 585.49 | 0.677 |
| 585.69 | 0.675 |
| 585.89 | 0.679 |
| 586.1 | 0.675 |
| 586.3 | 0.685 |
| 586.5 | 0.682 |
| 586.7 | 0.687 |
| 586.9 | 0.688 |
| 587.11 | 0.681 |
| 587.31 | 0.68 |
| 587.51 | 0.685 |
| 587.71 | 0.689 |
| 587.92 | 0.7 |
| 588.12 | 0.695 |
| 588.32 | 0.705 |
| 588.52 | 0.713 |
| 588.72 | 0.704 |
| 588.93 | 0.703 |
| 589.13 | 0.709 |
| 589.33 | 0.711 |
| 589.53 | 0.717 |
| 589.73 | 0.714 |
| 589.94 | 0.725 |
| 590.14 | 0.711 |
| 590.34 | 0.709 |
| 590.54 | 0.716 |
| 590.74 | 0.703 |
| 590.95 | 0.696 |
| 591.15 | 0.709 |
| 591.35 | 0.697 |
| 591.55 | 0.702 |
| 591.75 | 0.708 |
| 591.96 | 0.706 |
| 592.16 | 0.701 |
| 592.36 | 0.696 |
| 592.56 | 0.715 |
| 592.76 | 0.71 |
| 592.96 | 0.709 |
| 593.17 | 0.71 |
| 593.37 | 0.702 |
| 593.57 | 0.71 |
| 593.77 | 0.712 |
| 593.97 | 0.709 |
| 594.18 | 0.714 |
| 594.38 | 0.716 |
| 594.58 | 0.716 |
| 594.78 | 0.719 |
| 594.98 | 0.714 |
| 595.18 | 0.712 |
| 595.39 | 0.712 |
| 595.59 | 0.725 |
| 595.79 | 0.717 |
| 595.99 | 0.737 |
| 596.19 | 0.723 |
| 596.39 | 0.726 |
| 596.6 | 0.724 |
| 596.8 | 0.723 |
| 597.0 | 0.718 |
| 597.2 | 0.727 |
| 597.4 | 0.722 |
| 597.6 | 0.723 |
| 597.81 | 0.727 |
| 598.01 | 0.725 |
| 598.21 | 0.729 |
| 598.41 | 0.731 |
| 598.61 | 0.727 |
| 598.81 | 0.739 |
| 599.01 | 0.73 |
| 599.22 | 0.735 |
| 599.42 | 0.739 |
| 599.62 | 0.739 |
| 599.82 | 0.733 |
| 600.02 | 0.732 |
| 600.22 | 0.729 |
| 600.42 | 0.74 |
| 600.63 | 0.736 |
| 600.83 | 0.742 |
| 601.03 | 0.735 |
| 601.23 | 0.746 |
| 601.43 | 0.733 |
| 601.63 | 0.731 |
| 601.83 | 0.725 |
| 602.03 | 0.731 |
| 602.24 | 0.732 |
| 602.44 | 0.739 |
| 602.64 | 0.75 |
| 602.84 | 0.747 |
| 603.04 | 0.745 |
| 603.24 | 0.749 |
| 603.44 | 0.733 |
| 603.64 | 0.741 |
| 603.85 | 0.742 |
| 604.05 | 0.751 |
| 604.25 | 0.745 |
| 604.45 | 0.749 |
| 604.65 | 0.752 |
| 604.85 | 0.755 |
| 605.05 | 0.74 |
| 605.25 | 0.752 |
| 605.45 | 0.747 |
| 605.65 | 0.752 |
| 605.86 | 0.758 |
| 606.06 | 0.754 |
| 606.26 | 0.751 |
| 606.46 | 0.759 |
| 606.66 | 0.757 |
| 606.86 | 0.764 |
| 607.06 | 0.753 |
| 607.26 | 0.757 |
| 607.46 | 0.752 |
| 607.66 | 0.766 |
| 607.86 | 0.755 |
| 608.07 | 0.768 |
| 608.27 | 0.762 |
| 608.47 | 0.764 |
| 608.67 | 0.764 |
| 608.87 | 0.766 |
| 609.07 | 0.767 |
| 609.27 | 0.776 |
| 609.47 | 0.766 |
| 609.67 | 0.767 |
| 609.87 | 0.768 |
| 610.07 | 0.77 |
| 610.27 | 0.769 |
| 610.48 | 0.765 |
| 610.68 | 0.763 |
| 610.88 | 0.774 |
| 611.08 | 0.776 |
| 611.28 | 0.778 |
| 611.48 | 0.769 |
| 611.68 | 0.777 |
| 611.88 | 0.773 |
| 612.08 | 0.774 |
| 612.28 | 0.774 |
| 612.48 | 0.782 |
| 612.68 | 0.778 |
| 612.88 | 0.773 |
| 613.08 | 0.764 |
| 613.28 | 0.778 |
| 613.48 | 0.782 |
| 613.68 | 0.79 |
| 613.88 | 0.773 |
| 614.09 | 0.778 |
| 614.29 | 0.789 |
| 614.49 | 0.789 |
| 614.69 | 0.781 |
| 614.89 | 0.787 |
| 615.09 | 0.778 |
| 615.29 | 0.786 |
| 615.49 | 0.783 |
| 615.69 | 0.794 |
| 615.89 | 0.789 |
| 616.09 | 0.804 |
| 616.29 | 0.807 |
| 616.49 | 0.79 |
| 616.69 | 0.784 |
| 616.89 | 0.79 |
| 617.09 | 0.787 |
| 617.29 | 0.789 |
| 617.49 | 0.796 |
| 617.69 | 0.79 |
| 617.89 | 0.789 |
| 618.09 | 0.795 |
| 618.29 | 0.804 |
| 618.49 | 0.8 |
| 618.69 | 0.788 |
| 618.89 | 0.799 |
| 619.09 | 0.793 |
| 619.29 | 0.797 |
| 619.49 | 0.803 |
| 619.69 | 0.8 |
| 619.89 | 0.79 |
| 620.09 | 0.802 |
| 620.29 | 0.796 |
| 620.49 | 0.804 |
| 620.69 | 0.805 |
| 620.89 | 0.805 |
| 621.09 | 0.805 |
| 621.29 | 0.814 |
| 621.49 | 0.799 |
| 621.69 | 0.807 |
| 621.89 | 0.812 |
| 622.09 | 0.802 |
| 622.29 | 0.796 |
| 622.49 | 0.808 |
| 622.69 | 0.797 |
| 622.89 | 0.807 |
| 623.09 | 0.804 |
| 623.29 | 0.81 |
| 623.49 | 0.812 |
| 623.69 | 0.816 |
| 623.89 | 0.808 |
| 624.09 | 0.818 |
| 624.29 | 0.82 |
| 624.49 | 0.81 |
| 624.69 | 0.815 |
| 624.89 | 0.813 |
| 625.09 | 0.81 |
| 625.29 | 0.826 |
| 625.49 | 0.832 |
| 625.69 | 0.821 |
| 625.89 | 0.818 |
| 626.09 | 0.83 |
| 626.29 | 0.813 |
| 626.49 | 0.824 |
| 626.69 | 0.82 |
| 626.89 | 0.831 |
| 627.09 | 0.821 |
| 627.29 | 0.824 |
| 627.49 | 0.823 |
| 627.68 | 0.827 |
| 627.88 | 0.824 |
| 628.08 | 0.832 |
| 628.28 | 0.834 |
| 628.48 | 0.84 |
| 628.68 | 0.83 |
| 628.88 | 0.83 |
| 629.08 | 0.827 |
| 629.28 | 0.83 |
| 629.48 | 0.828 |
| 629.68 | 0.834 |
| 629.88 | 0.831 |
| 630.08 | 0.838 |
| 630.28 | 0.832 |
| 630.48 | 0.833 |
| 630.68 | 0.826 |
| 630.88 | 0.843 |
| 631.07 | 0.844 |
| 631.27 | 0.838 |
| 631.47 | 0.826 |
| 631.67 | 0.842 |
| 631.87 | 0.831 |
| 632.07 | 0.837 |
| 632.27 | 0.83 |
| 632.47 | 0.833 |
| 632.67 | 0.823 |
| 632.87 | 0.842 |
| 633.07 | 0.835 |
| 633.27 | 0.853 |
| 633.47 | 0.843 |
| 633.66 | 0.843 |
| 633.86 | 0.849 |
| 634.06 | 0.857 |
| 634.26 | 0.853 |
| 634.46 | 0.858 |
| 634.66 | 0.861 |
| 634.86 | 0.851 |
| 635.06 | 0.841 |
| 635.26 | 0.842 |
| 635.46 | 0.839 |
| 635.65 | 0.848 |
| 635.85 | 0.846 |
| 636.05 | 0.855 |
| 636.25 | 0.863 |
| 636.45 | 0.856 |
| 636.65 | 0.846 |
| 636.85 | 0.856 |
| 637.05 | 0.857 |
| 637.25 | 0.864 |
| 637.44 | 0.849 |
| 637.64 | 0.858 |
| 637.84 | 0.858 |
| 638.04 | 0.855 |
| 638.24 | 0.853 |
| 638.44 | 0.853 |
| 638.64 | 0.855 |
| 638.84 | 0.861 |
| 639.04 | 0.85 |
| 639.23 | 0.864 |
| 639.43 | 0.857 |
| 639.63 | 0.862 |
| 639.83 | 0.856 |
| 640.03 | 0.866 |
| 640.23 | 0.866 |
| 640.43 | 0.875 |
| 640.62 | 0.87 |
| 640.82 | 0.866 |
| 641.02 | 0.863 |
| 641.22 | 0.87 |
| 641.42 | 0.866 |
| 641.62 | 0.872 |
| 641.82 | 0.869 |
| 642.01 | 0.874 |
| 642.21 | 0.874 |
| 642.41 | 0.874 |
| 642.61 | 0.869 |
| 642.81 | 0.867 |
| 643.01 | 0.871 |
| 643.21 | 0.878 |
| 643.4 | 0.874 |
| 643.6 | 0.881 |
| 643.8 | 0.872 |
| 644.0 | 0.884 |
| 644.2 | 0.869 |
| 644.4 | 0.88 |
| 644.59 | 0.87 |
| 644.79 | 0.885 |
| 644.99 | 0.882 |
| 645.19 | 0.87 |
| 645.39 | 0.868 |
| 645.59 | 0.876 |
| 645.78 | 0.876 |
| 645.98 | 0.891 |
| 646.18 | 0.878 |
| 646.38 | 0.881 |
| 646.58 | 0.874 |
| 646.78 | 0.88 |
| 646.97 | 0.887 |
| 647.17 | 0.886 |
| 647.37 | 0.889 |
| 647.57 | 0.885 |
| 647.77 | 0.892 |
| 647.96 | 0.891 |
| 648.16 | 0.883 |
| 648.36 | 0.884 |
| 648.56 | 0.887 |
| 648.76 | 0.884 |
| 648.95 | 0.882 |
| 649.15 | 0.899 |
| 649.35 | 0.888 |
| 649.55 | 0.894 |
| 649.75 | 0.886 |
| 649.94 | 0.886 |
| 650.14 | 0.889 |
| 650.34 | 0.898 |
| 650.54 | 0.887 |
| 650.74 | 0.893 |
| 650.93 | 0.889 |
| 651.13 | 0.908 |
| 651.33 | 0.894 |
| 651.53 | 0.884 |
| 651.73 | 0.898 |
| 651.92 | 0.911 |
| 652.12 | 0.903 |
| 652.32 | 0.909 |
| 652.52 | 0.895 |
| 652.72 | 0.887 |
| 652.91 | 0.901 |
| 653.11 | 0.909 |
| 653.31 | 0.891 |
| 653.51 | 0.905 |
| 653.7 | 0.901 |
| 653.9 | 0.91 |
| 654.1 | 0.905 |
| 654.3 | 0.911 |
| 654.49 | 0.906 |
| 654.69 | 0.91 |
| 654.89 | 0.909 |
| 655.09 | 0.901 |
| 655.29 | 0.899 |
| 655.48 | 0.921 |
| 655.68 | 0.912 |
| 655.88 | 0.916 |
| 656.08 | 0.91 |
| 656.27 | 0.908 |
| 656.47 | 0.914 |
| 656.67 | 0.911 |
| 656.87 | 0.924 |
| 657.06 | 0.927 |
| 657.26 | 0.915 |
| 657.46 | 0.923 |
| 657.66 | 0.917 |
| 657.85 | 0.924 |
| 658.05 | 0.934 |
| 658.25 | 0.924 |
| 658.44 | 0.921 |
| 658.64 | 0.919 |
| 658.84 | 0.929 |
| 659.04 | 0.938 |
| 659.23 | 0.929 |
| 659.43 | 0.921 |
| 659.63 | 0.927 |
| 659.83 | 0.931 |
| 660.02 | 0.924 |
| 660.22 | 0.931 |
| 660.42 | 0.93 |
| 660.61 | 0.926 |
| 660.81 | 0.921 |
| 661.01 | 0.926 |
| 661.21 | 0.922 |
| 661.4 | 0.925 |
| 661.6 | 0.925 |
| 661.8 | 0.94 |
| 661.99 | 0.93 |
| 662.19 | 0.925 |
| 662.39 | 0.932 |
| 662.59 | 0.937 |
| 662.78 | 0.931 |
| 662.98 | 0.936 |
| 663.18 | 0.938 |
| 663.37 | 0.957 |
| 663.57 | 0.942 |
| 663.77 | 0.943 |
| 663.97 | 0.935 |
| 664.16 | 0.949 |
| 664.36 | 0.931 |
| 664.56 | 0.929 |
| 664.75 | 0.934 |
| 664.95 | 0.946 |
| 665.15 | 0.936 |
| 665.34 | 0.954 |
| 665.54 | 0.945 |
| 665.74 | 0.934 |
| 665.93 | 0.945 |
| 666.13 | 0.949 |
| 666.33 | 0.939 |
| 666.52 | 0.944 |
| 666.72 | 0.944 |
| 666.92 | 0.941 |
| 667.11 | 0.954 |
| 667.31 | 0.948 |
| 667.51 | 0.946 |
| 667.7 | 0.955 |
| 667.9 | 0.947 |
| 668.1 | 0.953 |
| 668.29 | 0.951 |
| 668.49 | 0.958 |
| 668.69 | 0.949 |
| 668.88 | 0.947 |
| 669.08 | 0.96 |
| 669.28 | 0.961 |
| 669.47 | 0.949 |
| 669.67 | 0.949 |
| 669.87 | 0.961 |
| 670.06 | 0.961 |
| 670.26 | 0.943 |
| 670.46 | 0.95 |
| 670.65 | 0.936 |
| 670.85 | 0.949 |
| 671.05 | 0.952 |
| 671.24 | 0.955 |
| 671.44 | 0.946 |
| 671.64 | 0.948 |
| 671.83 | 0.942 |
| 672.03 | 0.955 |
| 672.23 | 0.968 |
| 672.42 | 0.966 |
| 672.62 | 0.961 |
| 672.81 | 0.962 |
| 673.01 | 0.956 |
| 673.21 | 0.962 |
| 673.4 | 0.948 |
| 673.6 | 0.962 |
| 673.8 | 0.958 |
| 673.99 | 0.959 |
| 674.19 | 0.961 |
| 674.38 | 0.959 |
| 674.58 | 0.976 |
| 674.78 | 0.972 |
| 674.97 | 0.948 |
| 675.17 | 0.954 |
| 675.36 | 0.971 |
| 675.56 | 0.975 |
| 675.76 | 0.96 |
| 675.95 | 0.961 |
| 676.15 | 0.952 |
| 676.35 | 0.958 |
| 676.54 | 0.958 |
| 676.74 | 0.971 |
| 676.93 | 0.967 |
| 677.13 | 0.973 |
| 677.33 | 0.95 |
| 677.52 | 0.96 |
| 677.72 | 0.958 |
| 677.91 | 0.974 |
| 678.11 | 0.961 |
| 678.31 | 0.956 |
| 678.5 | 0.961 |
| 678.7 | 0.968 |
| 678.89 | 0.966 |
| 679.09 | 0.973 |
| 679.28 | 0.961 |
| 679.48 | 0.975 |
| 679.68 | 0.964 |
| 679.87 | 0.992 |
| 680.07 | 0.984 |
| 680.26 | 0.964 |
| 680.46 | 0.964 |
| 680.65 | 0.964 |
| 680.85 | 0.967 |
| 681.05 | 0.982 |
| 681.24 | 0.969 |
| 681.44 | 0.984 |
| 681.63 | 0.976 |
| 681.83 | 0.983 |
| 682.02 | 0.98 |
| 682.22 | 0.975 |
| 682.42 | 0.972 |
| 682.61 | 0.962 |
| 682.81 | 0.97 |
| 683.0 | 0.973 |
| 683.2 | 0.972 |
| 683.39 | 0.979 |
| 683.59 | 0.977 |
| 683.78 | 0.984 |
| 683.98 | 0.986 |
| 684.18 | 0.989 |
| 684.37 | 0.984 |
| 684.57 | 0.971 |
| 684.76 | 0.972 |
| 684.96 | 0.983 |
| 685.15 | 0.968 |
| 685.35 | 0.98 |
| 685.54 | 0.981 |
| 685.74 | 0.986 |
| 685.93 | 0.964 |
| 686.13 | 0.987 |
| 686.32 | 0.972 |
| 686.52 | 0.975 |
| 686.72 | 0.96 |
| 686.91 | 0.982 |
| 687.11 | 0.972 |
| 687.3 | 0.974 |
| 687.5 | 0.986 |
| 687.69 | 0.991 |
| 687.89 | 0.989 |
| 688.08 | 0.983 |
| 688.28 | 0.982 |
| 688.47 | 0.983 |
| 688.67 | 0.974 |
| 688.86 | 0.975 |
| 689.06 | 0.974 |
| 689.25 | 0.973 |
| 689.45 | 0.969 |
| 689.64 | 0.979 |
| 689.84 | 0.957 |
| 690.03 | 0.98 |
| 690.23 | 0.971 |
| 690.42 | 0.985 |
| 690.62 | 0.976 |
| 690.81 | 0.985 |
| 691.01 | 0.974 |
| 691.2 | 0.985 |
| 691.4 | 0.99 |
| 691.59 | 0.985 |
| 691.79 | 0.981 |
| 691.98 | 0.981 |
| 692.18 | 0.97 |
| 692.37 | 0.978 |
| 692.57 | 0.971 |
| 692.76 | 0.974 |
| 692.96 | 0.986 |
| 693.15 | 0.99 |
| 693.35 | 0.98 |
| 693.54 | 0.993 |
| 693.74 | 0.984 |
| 693.93 | 0.99 |
| 694.12 | 0.991 |
| 694.32 | 0.994 |
| 694.51 | 0.965 |
| 694.71 | 0.986 |
| 694.9 | 0.993 |
| 695.1 | 0.993 |
| 695.29 | 1 |
| 695.49 | 0.985 |
| 695.68 | 0.992 |
| 695.88 | 0.987 |
| 696.07 | 0.966 |
| 696.27 | 0.981 |
| 696.46 | 0.978 |
| 696.65 | 0.984 |
| 696.85 | 0.972 |
| 697.04 | 0.975 |
| 697.24 | 0.974 |
| 697.43 | 0.992 |
| 697.63 | 0.988 |
| 697.82 | 0.976 |
| 698.02 | 0.963 |
| 698.21 | 0.975 |
| 698.4 | 0.966 |
| 698.6 | 0.99 |
| 698.79 | 0.972 |
| 698.99 | 0.987 |
| 699.18 | 0.982 |
| 699.38 | 0.989 |
| 699.57 | 0.962 |
| 699.77 | 0.967 |
| 699.96 | 0.961 |
| 700.15 | 0.982 |
| 700.35 | 0.968 |
| 700.54 | 0.986 |
| 700.74 | 0.965 |
| 700.93 | 0.968 |
| 701.12 | 0.956 |
| 701.32 | 0.969 |
| 701.51 | 0.956 |
| 701.71 | 0.974 |
| 701.9 | 0.978 |
| 702.1 | 0.965 |
| 702.29 | 0.956 |
| 702.48 | 0.974 |
| 702.68 | 0.974 |
| 702.87 | 0.976 |
| 703.07 | 0.963 |
| 703.26 | 0.985 |
| 703.45 | 0.981 |
| 703.65 | 0.978 |
| 703.84 | 0.97 |
| 704.04 | 0.978 |
| 704.23 | 0.973 |
| 704.42 | 0.976 |
| 704.62 | 0.975 |
| 704.81 | 0.966 |
| 705.0 | 0.963 |
| 705.2 | 0.979 |
| 705.39 | 0.962 |
| 705.59 | 0.969 |
| 705.78 | 0.962 |
| 705.97 | 0.974 |
| 706.17 | 0.966 |
| 706.36 | 0.956 |
| 706.56 | 0.946 |
| 706.75 | 0.947 |
| 706.94 | 0.94 |
| 707.14 | 0.961 |
| 707.33 | 0.962 |
| 707.52 | 0.977 |
| 707.72 | 0.955 |
| 707.91 | 0.953 |
| 708.1 | 0.955 |
| 708.3 | 0.951 |
| 708.49 | 0.95 |
| 708.69 | 0.956 |
| 708.88 | 0.95 |
| 709.07 | 0.949 |
| 709.27 | 0.94 |
| 709.46 | 0.943 |
| 709.65 | 0.945 |
| 709.85 | 0.963 |
| 710.04 | 0.97 |
| 710.23 | 0.952 |
| 710.43 | 0.94 |
| 710.62 | 0.949 |
| 710.81 | 0.946 |
| 711.01 | 0.966 |
| 711.2 | 0.969 |
| 711.39 | 0.973 |
| 711.59 | 0.963 |
| 711.78 | 0.95 |
| 711.97 | 0.925 |
| 712.17 | 0.942 |
| 712.36 | 0.95 |
| 712.55 | 0.957 |
| 712.75 | 0.941 |
| 712.94 | 0.957 |
| 713.13 | 0.94 |
| 713.33 | 0.926 |
| 713.52 | 0.927 |
| 713.71 | 0.944 |
| 713.91 | 0.939 |
| 714.1 | 0.938 |
| 714.29 | 0.933 |
| 714.49 | 0.952 |
| 714.68 | 0.942 |
| 714.87 | 0.939 |
| 715.07 | 0.926 |
| 715.26 | 0.919 |
| 715.45 | 0.901 |
| 715.64 | 0.913 |
| 715.84 | 0.922 |
| 716.03 | 0.936 |
| 716.22 | 0.937 |
| 716.42 | 0.941 |
| 716.61 | 0.925 |
| 716.8 | 0.932 |
| 716.99 | 0.919 |
| 717.19 | 0.928 |
| 717.38 | 0.92 |
| 717.57 | 0.933 |
| 717.77 | 0.913 |
| 717.96 | 0.917 |
| 718.15 | 0.915 |
| 718.34 | 0.916 |
| 718.54 | 0.923 |
| 718.73 | 0.929 |
| 718.92 | 0.911 |
| 719.12 | 0.917 |
| 719.31 | 0.928 |
| 719.5 | 0.913 |
| 719.69 | 0.911 |
| 719.89 | 0.916 |
| 720.08 | 0.905 |
| 720.27 | 0.916 |
| 720.46 | 0.92 |
| 720.66 | 0.919 |
| 720.85 | 0.9 |
| 721.04 | 0.913 |
| 721.24 | 0.898 |
| 721.43 | 0.903 |
| 721.62 | 0.899 |
| 721.81 | 0.902 |
| 722.01 | 0.899 |
| 722.2 | 0.909 |
| 722.39 | 0.898 |
| 722.58 | 0.903 |
| 722.78 | 0.888 |
| 722.97 | 0.88 |
| 723.16 | 0.873 |
| 723.35 | 0.886 |
| 723.55 | 0.886 |
| 723.74 | 0.887 |
| 723.93 | 0.893 |
| 724.12 | 0.888 |
| 724.31 | 0.899 |
| 724.51 | 0.897 |
| 724.7 | 0.891 |
| 724.89 | 0.882 |
| 725.08 | 0.88 |
| 725.28 | 0.883 |
| 725.47 | 0.893 |
| 725.66 | 0.895 |
| 725.85 | 0.876 |
| 726.04 | 0.88 |
| 726.24 | 0.868 |
| 726.43 | 0.882 |
| 726.62 | 0.877 |
| 726.81 | 0.886 |
| 727.01 | 0.873 |
| 727.2 | 0.876 |
| 727.39 | 0.864 |
| 727.58 | 0.864 |
| 727.77 | 0.85 |
| 727.97 | 0.872 |
| 728.16 | 0.863 |
| 728.35 | 0.87 |
| 728.54 | 0.853 |
| 728.73 | 0.858 |
| 728.93 | 0.848 |
| 729.12 | 0.86 |
| 729.31 | 0.869 |
| 729.5 | 0.878 |
| 729.69 | 0.865 |
| 729.89 | 0.867 |
| 730.08 | 0.853 |
| 730.27 | 0.867 |
| 730.46 | 0.848 |
| 730.65 | 0.843 |
| 730.84 | 0.835 |
| 731.04 | 0.84 |
| 731.23 | 0.84 |
| 731.42 | 0.847 |
| 731.61 | 0.845 |
| 731.8 | 0.845 |
| 732.0 | 0.832 |
| 732.19 | 0.843 |
| 732.38 | 0.84 |
| 732.57 | 0.83 |
| 732.76 | 0.831 |
| 732.95 | 0.837 |
| 733.15 | 0.813 |
| 733.34 | 0.835 |
| 733.53 | 0.813 |
| 733.72 | 0.811 |
| 733.91 | 0.8 |
| 734.1 | 0.799 |
| 734.29 | 0.797 |
| 734.49 | 0.806 |
| 734.68 | 0.808 |
| 734.87 | 0.804 |
| 735.06 | 0.797 |
| 735.25 | 0.806 |
| 735.44 | 0.812 |
| 735.63 | 0.814 |
| 735.83 | 0.798 |
| 736.02 | 0.801 |
| 736.21 | 0.792 |
| 736.4 | 0.781 |
| 736.59 | 0.772 |
| 736.78 | 0.776 |
| 736.97 | 0.777 |
| 737.17 | 0.767 |
| 737.36 | 0.776 |
| 737.55 | 0.78 |
| 737.74 | 0.769 |
| 737.93 | 0.784 |
| 738.12 | 0.766 |
| 738.31 | 0.774 |
| 738.5 | 0.761 |
| 738.7 | 0.778 |
| 738.89 | 0.776 |
| 739.08 | 0.777 |
| 739.27 | 0.772 |
| 739.46 | 0.77 |
| 739.65 | 0.769 |
| 739.84 | 0.77 |
| 740.03 | 0.752 |
| 740.22 | 0.763 |
| 740.41 | 0.744 |
| 740.61 | 0.748 |
| 740.8 | 0.742 |
| 740.99 | 0.747 |
| 741.18 | 0.743 |
| 741.37 | 0.756 |
| 741.56 | 0.759 |
| 741.75 | 0.751 |
| 741.94 | 0.729 |
| 742.13 | 0.731 |
| 742.32 | 0.717 |
| 742.51 | 0.729 |
| 742.71 | 0.728 |
| 742.9 | 0.741 |
| 743.09 | 0.737 |
| 743.28 | 0.728 |
| 743.47 | 0.715 |
| 743.66 | 0.721 |
| 743.85 | 0.709 |
| 744.04 | 0.704 |
| 744.23 | 0.695 |
| 744.42 | 0.713 |
| 744.61 | 0.695 |
| 744.8 | 0.696 |
| 744.99 | 0.691 |
| 745.19 | 0.687 |
| 745.38 | 0.685 |
| 745.57 | 0.696 |
| 745.76 | 0.678 |
| 745.95 | 0.688 |
| 746.14 | 0.687 |
| 746.33 | 0.685 |
| 746.52 | 0.676 |
| 746.71 | 0.665 |
| 746.9 | 0.673 |
| 747.09 | 0.681 |
| 747.28 | 0.665 |
| 747.47 | 0.677 |
| 747.66 | 0.654 |
| 747.85 | 0.66 |
| 748.04 | 0.643 |
| 748.23 | 0.653 |
| 748.42 | 0.649 |
| 748.61 | 0.643 |
| 748.8 | 0.637 |
| 748.99 | 0.639 |
| 749.18 | 0.635 |
| 749.37 | 0.64 |
| 749.56 | 0.626 |
| 749.76 | 0.634 |
| 749.95 | 0.631 |
| 750.14 | 0.636 |
| 750.33 | 0.629 |
| 750.52 | 0.636 |
| 750.71 | 0.625 |
| 750.9 | 0.628 |
| 751.09 | 0.61 |
| 751.28 | 0.612 |
| 751.47 | 0.603 |
| 751.66 | 0.616 |
| 751.85 | 0.596 |
| 752.04 | 0.599 |
| 752.23 | 0.588 |
| 752.42 | 0.588 |
| 752.61 | 0.606 |
| 752.8 | 0.605 |
| 752.99 | 0.599 |
| 753.18 | 0.597 |
| 753.37 | 0.586 |
| 753.56 | 0.576 |
| 753.75 | 0.574 |
| 753.94 | 0.577 |
| 754.13 | 0.566 |
| 754.32 | 0.577 |
| 754.51 | 0.572 |
| 754.7 | 0.569 |
| 754.89 | 0.566 |
| 755.08 | 0.563 |
| 755.26 | 0.555 |
| 755.45 | 0.556 |
| 755.64 | 0.56 |
| 755.83 | 0.543 |
| 756.02 | 0.53 |
| 756.21 | 0.532 |
| 756.4 | 0.533 |
| 756.59 | 0.531 |
| 756.78 | 0.52 |
| 756.97 | 0.522 |
| 757.16 | 0.518 |
| 757.35 | 0.508 |
| 757.54 | 0.5 |
| 757.73 | 0.521 |
| 757.92 | 0.517 |
| 758.11 | 0.504 |
| 758.3 | 0.501 |
| 758.49 | 0.509 |
| 758.68 | 0.494 |
| 758.87 | 0.494 |
| 759.06 | 0.488 |
| 759.25 | 0.494 |
| 759.44 | 0.489 |
| 759.63 | 0.483 |
| 759.81 | 0.478 |
| 760.0 | 0.475 |
| 760.19 | 0.471 |
| 760.38 | 0.476 |
| 760.57 | 0.475 |
| 760.76 | 0.475 |
| 760.95 | 0.471 |
| 761.14 | 0.467 |
| 761.33 | 0.463 |
| 761.52 | 0.461 |
| 761.71 | 0.459 |
| 761.9 | 0.461 |
| 762.09 | 0.451 |
| 762.27 | 0.449 |
| 762.46 | 0.433 |
| 762.65 | 0.442 |
| 762.84 | 0.441 |
| 763.03 | 0.442 |
| 763.22 | 0.44 |
| 763.41 | 0.445 |
| 763.6 | 0.441 |
| 763.79 | 0.432 |
| 763.98 | 0.415 |
| 764.17 | 0.429 |
| 764.35 | 0.429 |
| 764.54 | 0.42 |
| 764.73 | 0.418 |
| 764.92 | 0.41 |
| 765.11 | 0.406 |
| 765.3 | 0.408 |
| 765.49 | 0.409 |
| 765.68 | 0.418 |
| 765.87 | 0.411 |
| 766.05 | 0.407 |
| 766.24 | 0.397 |
| 766.43 | 0.404 |
| 766.62 | 0.394 |
| 766.81 | 0.397 |
| 767.0 | 0.393 |
| 767.19 | 0.404 |
| 767.38 | 0.388 |
| 767.56 | 0.393 |
| 767.75 | 0.378 |
| 767.94 | 0.382 |
| 768.13 | 0.379 |
| 768.32 | 0.372 |
| 768.51 | 0.378 |
| 768.7 | 0.377 |
| 768.89 | 0.367 |
| 769.07 | 0.367 |
| 769.26 | 0.363 |
| 769.45 | 0.362 |
| 769.64 | 0.357 |
| 769.83 | 0.364 |
| 770.02 | 0.362 |
| 770.21 | 0.365 |
| 770.39 | 0.355 |
| 770.58 | 0.362 |
| 770.77 | 0.348 |
| 770.96 | 0.354 |
| 771.15 | 0.345 |
| 771.34 | 0.342 |
| 771.52 | 0.346 |
| 771.71 | 0.346 |
| 771.9 | 0.342 |
| 772.09 | 0.344 |
| 772.28 | 0.341 |
| 772.47 | 0.339 |
| 772.65 | 0.325 |
| 772.84 | 0.332 |
| 773.03 | 0.324 |
| 773.22 | 0.331 |
| 773.41 | 0.342 |
| 773.6 | 0.338 |
| 773.78 | 0.334 |
| 773.97 | 0.344 |
| 774.16 | 0.334 |
| 774.35 | 0.335 |
| 774.54 | 0.331 |
| 774.72 | 0.325 |
| 774.91 | 0.329 |
| 775.1 | 0.33 |
| 775.29 | 0.325 |
| 775.48 | 0.327 |
| 775.66 | 0.318 |
| 775.85 | 0.315 |
| 776.04 | 0.319 |
| 776.23 | 0.313 |
| 776.42 | 0.315 |
| 776.6 | 0.325 |
| 776.79 | 0.322 |
| 776.98 | 0.322 |
| 777.17 | 0.316 |
| 777.36 | 0.311 |
| 777.54 | 0.312 |
| 777.73 | 0.309 |
| 777.92 | 0.312 |
| 778.11 | 0.319 |
| 778.29 | 0.317 |
| 778.48 | 0.315 |
| 778.67 | 0.312 |
| 778.86 | 0.314 |
| 779.05 | 0.305 |
| 779.23 | 0.307 |
| 779.42 | 0.3 |
| 779.61 | 0.312 |
| 779.8 | 0.309 |
| 779.98 | 0.312 |
| 780.17 | 0.309 |
| 780.36 | 0.309 |
| 780.55 | 0.309 |
| 780.73 | 0.309 |
| 780.92 | 0.306 |
| 781.11 | 0.315 |
| 781.3 | 0.311 |
| 781.48 | 0.313 |
| 781.67 | 0.304 |
| 781.86 | 0.314 |
| 782.05 | 0.304 |
| 782.23 | 0.307 |
| 782.42 | 0.302 |
| 782.61 | 0.302 |
| 782.8 | 0.305 |
| 782.98 | 0.307 |
| 783.17 | 0.3 |
| 783.36 | 0.303 |
| 783.54 | 0.301 |
| 783.73 | 0.305 |
| 783.92 | 0.304 |
| 784.11 | 0.313 |
| 784.29 | 0.311 |
| 784.48 | 0.313 |
| 784.67 | 0.301 |
| 784.86 | 0.309 |
| 785.04 | 0.309 |
| 785.23 | 0.312 |
| 785.42 | 0.307 |
| 785.6 | 0.306 |
| 785.79 | 0.302 |
| 785.98 | 0.31 |
| 786.17 | 0.309 |
| 786.35 | 0.316 |
| 786.54 | 0.31 |
| 786.73 | 0.314 |
| 786.91 | 0.309 |
| 787.1 | 0.309 |
| 787.29 | 0.309 |
| 787.47 | 0.312 |
| 787.66 | 0.313 |
| 787.85 | 0.318 |
| 788.04 | 0.32 |
| 788.22 | 0.314 |
| 788.41 | 0.314 |
| 788.6 | 0.31 |
| 788.78 | 0.311 |
| 788.97 | 0.312 |
| 789.16 | 0.305 |
| 789.34 | 0.308 |
| 789.53 | 0.298 |
| 789.72 | 0.313 |
| 789.9 | 0.307 |
| 790.09 | 0.302 |
| 790.28 | 0.304 |
| 790.46 | 0.31 |
| 790.65 | 0.311 |
| 790.84 | 0.327 |
| 791.02 | 0.319 |
| 791.21 | 0.312 |
| 791.4 | 0.306 |
| 791.58 | 0.314 |
| 791.77 | 0.311 |
| 791.96 | 0.317 |
| 792.14 | 0.319 |
| 792.33 | 0.317 |
| 792.52 | 0.311 |
| 792.7 | 0.316 |
| 792.89 | 0.311 |
| 793.08 | 0.313 |
| 793.26 | 0.314 |
| 793.45 | 0.317 |
| 793.63 | 0.314 |
| 793.82 | 0.321 |
| 794.01 | 0.311 |
| 794.19 | 0.319 |
| 794.38 | 0.316 |
| 794.57 | 0.316 |
| 794.75 | 0.313 |
| 794.94 | 0.306 |
| 795.12 | 0.312 |
| 795.31 | 0.322 |
| 795.5 | 0.314 |
| 795.68 | 0.32 |
| 795.87 | 0.324 |
| 796.06 | 0.318 |
| 796.24 | 0.32 |
| 796.43 | 0.328 |
| 796.61 | 0.325 |
| 796.8 | 0.335 |
| 796.99 | 0.331 |
| 797.17 | 0.327 |
| 797.36 | 0.325 |
| 797.54 | 0.325 |
| 797.73 | 0.321 |
| 797.92 | 0.324 |
| 798.1 | 0.318 |
| 798.29 | 0.322 |
| 798.47 | 0.331 |
| 798.66 | 0.337 |
| 798.85 | 0.329 |
| 799.03 | 0.342 |
| 799.22 | 0.329 |
| 799.4 | 0.329 |
| 799.59 | 0.324 |
| 799.78 | 0.328 |
| 799.96 | 0.329 |
| 800.15 | 0.328 |
| 800.33 | 0.332 |
| 800.52 | 0.337 |
| 800.7 | 0.326 |
| 800.89 | 0.326 |
| 801.08 | 0.323 |
| 801.26 | 0.325 |
| 801.45 | 0.325 |
| 801.63 | 0.347 |
| 801.82 | 0.339 |
| 802.0 | 0.338 |
| 802.19 | 0.334 |
| 802.38 | 0.343 |
| 802.56 | 0.339 |
| 802.75 | 0.339 |
| 802.93 | 0.329 |
| 803.12 | 0.335 |
| 803.3 | 0.331 |
| 803.49 | 0.336 |
| 803.67 | 0.328 |
| 803.86 | 0.336 |
| 804.05 | 0.323 |
| 804.23 | 0.338 |
| 804.42 | 0.34 |
| 804.6 | 0.334 |
| 804.79 | 0.342 |
| 804.97 | 0.341 |
| 805.16 | 0.345 |
| 805.34 | 0.337 |
| 805.53 | 0.338 |
| 805.71 | 0.33 |
| 805.9 | 0.332 |
| 806.08 | 0.338 |
| 806.27 | 0.335 |
| 806.45 | 0.343 |
| 806.64 | 0.329 |
| 806.82 | 0.333 |
| 807.01 | 0.329 |
| 807.2 | 0.325 |
| 807.38 | 0.324 |
| 807.57 | 0.326 |
| 807.75 | 0.33 |
| 807.94 | 0.325 |
| 808.12 | 0.326 |
| 808.31 | 0.327 |
| 808.49 | 0.326 |
| 808.68 | 0.329 |
| 808.86 | 0.324 |
| 809.05 | 0.333 |
| 809.23 | 0.326 |
| 809.42 | 0.33 |
| 809.6 | 0.324 |
| 809.79 | 0.321 |
| 809.97 | 0.33 |
| 810.16 | 0.326 |
| 810.34 | 0.335 |
| 810.52 | 0.331 |
| 810.71 | 0.331 |
| 810.89 | 0.339 |
| 811.08 | 0.338 |
| 811.26 | 0.334 |
| 811.45 | 0.328 |
| 811.63 | 0.332 |
| 811.82 | 0.324 |
| 812.0 | 0.33 |
| 812.19 | 0.327 |
| 812.37 | 0.325 |
| 812.56 | 0.334 |
| 812.74 | 0.336 |
| 812.93 | 0.325 |
| 813.11 | 0.333 |
| 813.3 | 0.332 |
| 813.48 | 0.33 |
| 813.66 | 0.332 |
| 813.85 | 0.333 |
| 814.03 | 0.323 |
| 814.22 | 0.328 |
| 814.4 | 0.332 |
| 814.59 | 0.334 |
| 814.77 | 0.327 |
| 814.96 | 0.33 |
| 815.14 | 0.319 |
| 815.32 | 0.328 |
| 815.51 | 0.326 |
| 815.69 | 0.327 |
| 815.88 | 0.323 |
| 816.06 | 0.326 |
| 816.25 | 0.316 |
| 816.43 | 0.317 |
| 816.61 | 0.311 |
| 816.8 | 0.316 |
| 816.98 | 0.313 |
| 817.17 | 0.324 |
| 817.35 | 0.333 |
| 817.54 | 0.326 |
| 817.72 | 0.321 |
| 817.9 | 0.318 |
| 818.09 | 0.315 |
| 818.27 | 0.316 |
| 818.46 | 0.307 |
| 818.64 | 0.311 |
| 818.82 | 0.313 |
| 819.01 | 0.314 |
| 819.19 | 0.312 |
| 819.38 | 0.319 |
| 819.56 | 0.309 |
| 819.74 | 0.316 |
| 819.93 | 0.31 |
| 820.11 | 0.314 |
| 820.3 | 0.306 |
| 820.48 | 0.314 |
| 820.66 | 0.306 |
| 820.85 | 0.318 |
| 821.03 | 0.304 |
| 821.22 | 0.314 |
| 821.4 | 0.309 |
| 821.58 | 0.315 |
| 821.77 | 0.315 |
| 821.95 | 0.318 |
| 822.13 | 0.305 |
| 822.32 | 0.315 |
| 822.5 | 0.313 |
| 822.69 | 0.311 |
| 822.87 | 0.311 |
| 823.05 | 0.324 |
| 823.24 | 0.324 |
| 823.42 | 0.323 |
| 823.6 | 0.331 |
| 823.79 | 0.34 |
| 823.97 | 0.332 |
| 824.15 | 0.328 |
| 824.34 | 0.324 |
| 824.52 | 0.327 |
| 824.71 | 0.315 |
| 824.89 | 0.328 |
| 825.07 | 0.31 |
| 825.26 | 0.312 |
| 825.44 | 0.308 |
| 825.62 | 0.314 |
| 825.81 | 0.319 |
| 825.99 | 0.314 |
| 826.17 | 0.299 |
| 826.36 | 0.304 |
| 826.54 | 0.311 |
| 826.72 | 0.306 |
| 826.91 | 0.301 |
| 827.09 | 0.309 |
| 827.27 | 0.303 |
| 827.46 | 0.307 |
| 827.64 | 0.303 |
| 827.82 | 0.304 |
| 828.0 | 0.3 |
| 828.19 | 0.292 |
| 828.37 | 0.292 |
| 828.55 | 0.299 |
| 828.74 | 0.299 |
| 828.92 | 0.305 |
| 829.1 | 0.295 |
| 829.29 | 0.297 |
| 829.47 | 0.301 |
| 829.65 | 0.294 |
| 829.84 | 0.293 |
| 830.02 | 0.301 |
| 830.2 | 0.292 |
| 830.38 | 0.291 |
| 830.57 | 0.292 |
| 830.75 | 0.289 |
| 830.93 | 0.291 |
| 831.12 | 0.288 |
| 831.3 | 0.285 |
| 831.48 | 0.282 |
| 831.66 | 0.283 |
| 831.85 | 0.285 |
| 832.03 | 0.287 |
| 832.21 | 0.282 |
| 832.4 | 0.269 |
| 832.58 | 0.286 |
| 832.76 | 0.272 |
| 832.94 | 0.267 |
| 833.13 | 0.271 |
| 833.31 | 0.285 |
| 833.49 | 0.281 |
| 833.67 | 0.278 |
| 833.86 | 0.273 |
| 834.04 | 0.282 |
| 834.22 | 0.288 |
| 834.41 | 0.287 |
| 834.59 | 0.283 |
| 834.77 | 0.294 |
| 834.95 | 0.279 |
| 835.14 | 0.28 |
| 835.32 | 0.281 |
| 835.5 | 0.288 |
| 835.68 | 0.284 |
| 835.86 | 0.279 |
| 836.05 | 0.279 |
| 836.23 | 0.277 |
| 836.41 | 0.267 |
| 836.59 | 0.27 |
| 836.78 | 0.273 |
| 836.96 | 0.268 |
| 837.14 | 0.27 |
| 837.32 | 0.269 |
| 837.51 | 0.26 |
| 837.69 | 0.278 |
| 837.87 | 0.271 |
| 838.05 | 0.281 |
| 838.23 | 0.274 |
| 838.42 | 0.268 |
| 838.6 | 0.27 |
| 838.78 | 0.258 |
| 838.96 | 0.269 |
| 839.15 | 0.263 |
| 839.33 | 0.266 |
| 839.51 | 0.28 |
| 839.69 | 0.266 |
| 839.87 | 0.276 |
| 840.06 | 0.266 |
| 840.24 | 0.266 |
| 840.42 | 0.261 |
| 840.6 | 0.271 |
| 840.78 | 0.271 |
| 840.97 | 0.258 |
| 841.15 | 0.268 |
| 841.33 | 0.269 |
| 841.51 | 0.269 |
| 841.69 | 0.266 |
| 841.87 | 0.269 |
| 842.06 | 0.267 |
| 842.24 | 0.261 |
| 842.42 | 0.261 |
| 842.6 | 0.261 |
| 842.78 | 0.263 |
| 842.97 | 0.258 |
| 843.15 | 0.264 |
| 843.33 | 0.265 |
| 843.51 | 0.259 |
| 843.69 | 0.266 |
| 843.87 | 0.264 |
| 844.06 | 0.259 |
| 844.24 | 0.257 |
| 844.42 | 0.253 |
| 844.6 | 0.26 |
| 844.78 | 0.245 |
| 844.96 | 0.254 |
| 845.14 | 0.252 |
| 845.33 | 0.258 |
| 845.51 | 0.258 |
| 845.69 | 0.261 |
| 845.87 | 0.257 |
| 846.05 | 0.254 |
| 846.23 | 0.261 |
| 846.41 | 0.252 |
| 846.6 | 0.251 |
| 846.78 | 0.261 |
| 846.96 | 0.247 |
| 847.14 | 0.258 |
| 847.32 | 0.248 |
| 847.5 | 0.254 |
| 847.68 | 0.246 |
| 847.86 | 0.258 |
| 848.05 | 0.258 |
| 848.23 | 0.258 |
| 848.41 | 0.257 |
| 848.59 | 0.257 |
| 848.77 | 0.248 |
| 848.95 | 0.26 |
| 849.13 | 0.265 |
| 849.31 | 0.266 |
| 849.5 | 0.259 |
| 849.68 | 0.255 |
| 849.86 | 0.246 |
| 850.04 | 0.262 |
| 850.22 | 0.264 |
| 850.4 | 0.253 |
| 850.58 | 0.254 |
| 850.76 | 0.256 |
| 850.94 | 0.252 |
| 851.12 | 0.252 |
| 851.3 | 0.247 |
| 851.49 | 0.252 |
| 851.67 | 0.253 |
| 851.85 | 0.248 |
| 852.03 | 0.256 |
| 852.21 | 0.256 |
| 852.39 | 0.25 |
| 852.57 | 0.255 |
| 852.75 | 0.255 |
| 852.93 | 0.266 |
| 853.11 | 0.26 |
| 853.29 | 0.258 |
| 853.47 | 0.261 |
| 853.65 | 0.268 |
| 853.84 | 0.262 |
| 854.02 | 0.263 |
| 854.2 | 0.254 |
| 854.38 | 0.256 |
| 854.56 | 0.249 |
| 854.74 | 0.255 |
| 854.92 | 0.253 |
| 855.1 | 0.254 |
| 855.28 | 0.255 |
| 855.46 | 0.266 |
| 855.64 | 0.248 |
| 855.82 | 0.251 |
| 856.0 | 0.271 |
| 856.18 | 0.262 |
| 856.36 | 0.255 |
| 856.54 | 0.259 |
| 856.72 | 0.252 |
| 856.9 | 0.256 |
| 857.08 | 0.267 |
| 857.26 | 0.267 |
| 857.44 | 0.26 |
| 857.62 | 0.263 |
| 857.8 | 0.26 |
| 857.99 | 0.262 |
| 858.17 | 0.256 |
| 858.35 | 0.262 |
| 858.53 | 0.256 |
| 858.71 | 0.25 |
| 858.89 | 0.262 |
| 859.07 | 0.268 |
| 859.25 | 0.273 |
| 859.43 | 0.266 |
| 859.61 | 0.267 |
| 859.79 | 0.266 |
| 859.97 | 0.263 |
| 860.15 | 0.273 |
| 860.33 | 0.255 |
| 860.51 | 0.266 |
| 860.69 | 0.252 |
| 860.87 | 0.262 |
| 861.05 | 0.256 |
| 861.23 | 0.267 |
| 861.41 | 0.258 |
| 861.59 | 0.265 |
| 861.77 | 0.264 |
| 861.95 | 0.27 |
| 862.12 | 0.262 |
| 862.3 | 0.27 |
| 862.48 | 0.256 |
| 862.66 | 0.268 |
| 862.84 | 0.263 |
| 863.02 | 0.273 |
| 863.2 | 0.262 |
| 863.38 | 0.279 |
| 863.56 | 0.269 |
| 863.74 | 0.272 |
| 863.92 | 0.262 |
| 864.1 | 0.274 |
| 864.28 | 0.273 |
| 864.46 | 0.274 |
| 864.64 | 0.279 |
| 864.82 | 0.276 |
| 865.0 | 0.283 |
| 865.18 | 0.267 |
| 865.36 | 0.258 |
| 865.54 | 0.269 |
| 865.72 | 0.261 |
| 865.9 | 0.275 |
| 866.08 | 0.272 |
| 866.26 | 0.273 |
| 866.43 | 0.265 |
| 866.61 | 0.262 |
| 866.79 | 0.276 |
| 866.97 | 0.275 |
| 867.15 | 0.286 |
| 867.33 | 0.289 |
| 867.51 | 0.278 |
| 867.69 | 0.278 |
| 867.87 | 0.271 |
| 868.05 | 0.28 |
| 868.23 | 0.269 |
| 868.41 | 0.275 |
| 868.59 | 0.277 |
| 868.76 | 0.275 |
| 868.94 | 0.272 |
| 869.12 | 0.273 |
| 869.3 | 0.265 |
| 869.48 | 0.286 |
| 869.66 | 0.275 |
| 869.84 | 0.273 |
| 870.02 | 0.283 |
| 870.2 | 0.287 |
| 870.38 | 0.278 |
| 870.55 | 0.283 |
| 870.73 | 0.271 |
| 870.91 | 0.28 |
| 871.09 | 0.269 |
| 871.27 | 0.288 |
| 871.45 | 0.292 |
| 871.63 | 0.29 |
| 871.81 | 0.288 |
| 871.99 | 0.295 |
| 872.16 | 0.268 |
| 872.34 | 0.287 |
| 872.52 | 0.268 |
| 872.7 | 0.279 |
| 872.88 | 0.278 |
| 873.06 | 0.26 |
| 873.24 | 0.279 |
| 873.41 | 0.276 |
| 873.59 | 0.281 |
| 873.77 | 0.272 |
| 873.95 | 0.273 |
| 874.13 | 0.275 |
| 874.31 | 0.277 |
| 874.49 | 0.296 |
| 874.66 | 0.293 |
| 874.84 | 0.284 |
| 875.02 | 0.283 |
| 875.2 | 0.287 |
| 875.38 | 0.28 |
| 875.56 | 0.284 |
| 875.74 | 0.281 |
| 875.91 | 0.282 |
| 876.09 | 0.285 |
| 876.27 | 0.283 |
| 876.45 | 0.293 |
| 876.63 | 0.268 |
| 876.81 | 0.278 |
| 876.98 | 0.285 |
| 877.16 | 0.279 |
| 877.34 | 0.287 |
| 877.52 | 0.295 |
| 877.7 | 0.29 |
| 877.87 | 0.287 |
| 878.05 | 0.284 |
| 878.23 | 0.297 |
| 878.41 | 0.295 |
| 878.59 | 0.301 |
| 878.77 | 0.289 |
| 878.94 | 0.277 |
| 879.12 | 0.296 |
| 879.3 | 0.298 |
| 879.48 | 0.295 |
| 879.66 | 0.29 |
| 879.83 | 0.289 |
| 880.01 | 0.287 |
| 880.19 | 0.286 |
| 880.37 | 0.294 |
| 880.55 | 0.295 |
| 880.72 | 0.288 |
| 880.9 | 0.292 |
| 881.08 | 0.304 |
| 881.26 | 0.299 |
| 881.43 | 0.299 |
| 881.61 | 0.308 |
| 881.79 | 0.319 |
| 881.97 | 0.31 |
| 882.15 | 0.315 |
| 882.32 | 0.335 |
| 882.5 | 0.325 |
| 882.68 | 0.33 |
| 882.86 | 0.317 |
| 883.03 | 0.331 |
| 883.21 | 0.333 |
| 883.39 | 0.325 |
| 883.57 | 0.336 |
| 883.74 | 0.332 |
| 883.92 | 0.326 |
| 884.1 | 0.314 |
| 884.28 | 0.317 |
| 884.45 | 0.301 |
| 884.63 | 0.303 |
| 884.81 | 0.297 |
| 884.99 | 0.294 |
| 885.16 | 0.296 |
| 885.34 | 0.293 |
| 885.52 | 0.295 |
| 885.7 | 0.3 |
| 885.87 | 0.301 |
| 886.05 | 0.307 |
| 886.23 | 0.303 |
| 886.4 | 0.304 |
| 886.58 | 0.31 |
| 886.76 | 0.292 |
| 886.94 | 0.297 |
| 887.11 | 0.289 |
| 887.29 | 0.292 |
| 887.47 | 0.288 |
| 887.65 | 0.291 |
| 887.82 | 0.295 |
| 888.0 | 0.308 |
| 888.18 | 0.307 |
| 888.35 | 0.301 |
| 888.53 | 0.309 |
| 888.71 | 0.297 |
| 888.88 | 0.288 |
| 889.06 | 0.29 |
| 889.24 | 0.295 |
| 889.42 | 0.292 |
| 889.59 | 0.287 |
| 889.77 | 0.302 |
| 889.95 | 0.299 |
| 890.12 | 0.298 |
| 890.3 | 0.296 |
| 890.48 | 0.274 |
| 890.65 | 0.281 |
| 890.83 | 0.294 |
| 891.01 | 0.295 |
| 891.18 | 0.289 |
| 891.36 | 0.298 |
| 891.54 | 0.287 |
| 891.71 | 0.292 |
| 891.89 | 0.288 |
| 892.07 | 0.296 |
| 892.24 | 0.302 |
| 892.42 | 0.3 |
| 892.6 | 0.294 |
| 892.77 | 0.298 |
| 892.95 | 0.309 |
| 893.13 | 0.311 |
| 893.3 | 0.308 |
| 893.48 | 0.31 |
| 893.66 | 0.309 |
| 893.83 | 0.303 |
| 894.01 | 0.3 |
| 894.19 | 0.292 |
| 894.36 | 0.288 |
| 894.54 | 0.292 |
| 894.71 | 0.297 |
| 894.89 | 0.287 |
| 895.07 | 0.308 |
| 895.24 | 0.301 |
| 895.42 | 0.304 |
| 895.6 | 0.297 |
| 895.77 | 0.297 |
| 895.95 | 0.3 |
| 896.13 | 0.309 |
| 896.3 | 0.312 |
| 896.48 | 0.309 |
| 896.65 | 0.287 |
| 896.83 | 0.291 |
| 897.01 | 0.305 |
| 897.18 | 0.294 |
| 897.36 | 0.29 |
| 897.53 | 0.296 |
| 897.71 | 0.291 |
| 897.89 | 0.288 |
| 898.06 | 0.3 |
| 898.24 | 0.29 |
| 898.41 | 0.304 |
| 898.59 | 0.292 |
| 898.77 | 0.289 |
| 898.94 | 0.286 |
| 899.12 | 0.287 |
| 899.29 | 0.298 |
| 899.47 | 0.28 |
| 899.65 | 0.305 |
| 899.82 | 0.278 |
| 900.0 | 0.285 |
| 900.17 | 0.293 |
| 900.35 | 0.299 |
| 900.52 | 0.285 |
| 900.7 | 0.299 |
| 900.88 | 0.282 |
| 901.05 | 0.301 |
| 901.23 | 0.293 |
| 901.4 | 0.291 |
| 901.58 | 0.292 |
| 901.75 | 0.292 |
| 901.93 | 0.3 |
| 902.11 | 0.287 |
| 902.28 | 0.284 |
| 902.46 | 0.298 |
| 902.63 | 0.3 |
| 902.81 | 0.299 |
| 902.98 | 0.302 |
| 903.16 | 0.291 |
| 903.33 | 0.298 |
| 903.51 | 0.287 |
| 903.68 | 0.29 |
| 903.86 | 0.29 |
| 904.04 | 0.285 |
| 904.21 | 0.299 |
| 904.39 | 0.3 |
| 904.56 | 0.295 |
| 904.74 | 0.296 |
| 904.91 | 0.303 |
| 905.09 | 0.297 |
| 905.26 | 0.287 |
| 905.44 | 0.31 |
| 905.61 | 0.312 |
| 905.79 | 0.299 |
| 905.96 | 0.298 |
| 906.14 | 0.292 |
| 906.31 | 0.284 |
| 906.49 | 0.279 |
| 906.66 | 0.291 |
| 906.84 | 0.276 |
| 907.01 | 0.303 |
| 907.19 | 0.294 |
| 907.36 | 0.301 |
| 907.54 | 0.297 |
| 907.71 | 0.294 |
| 907.89 | 0.292 |
| 908.06 | 0.296 |
| 908.24 | 0.284 |
| 908.41 | 0.29 |
| 908.59 | 0.283 |
| 908.76 | 0.291 |
| 908.94 | 0.289 |
| 909.11 | 0.29 |
| 909.29 | 0.278 |
| 909.46 | 0.271 |
| 909.64 | 0.264 |
| 909.81 | 0.289 |
| 909.99 | 0.291 |
| 910.16 | 0.284 |
| 910.34 | 0.274 |
| 910.51 | 0.284 |
| 910.68 | 0.29 |
| 910.86 | 0.285 |
| 911.03 | 0.279 |
| 911.21 | 0.269 |
| 911.38 | 0.282 |
| 911.56 | 0.271 |
| 911.73 | 0.268 |
| 911.91 | 0.274 |
| 912.08 | 0.276 |
| 912.26 | 0.288 |
| 912.43 | 0.275 |
| 912.6 | 0.26 |
| 912.78 | 0.261 |
| 912.95 | 0.25 |
| 913.13 | 0.252 |
| 913.3 | 0.274 |
| 913.48 | 0.286 |
| 913.65 | 0.26 |
| 913.82 | 0.275 |
| 914.0 | 0.272 |
| 914.17 | 0.271 |
| 914.35 | 0.275 |
| 914.52 | 0.273 |
| 914.7 | 0.288 |
| 914.87 | 0.274 |
| 915.04 | 0.277 |
| 915.22 | 0.262 |
| 915.39 | 0.296 |
| 915.57 | 0.287 |
| 915.74 | 0.286 |
| 915.91 | 0.263 |
| 916.09 | 0.273 |
| 916.26 | 0.28 |
| 916.44 | 0.285 |
| 916.61 | 0.29 |
| 916.78 | 0.277 |
| 916.96 | 0.296 |
| 917.13 | 0.296 |
| 917.31 | 0.289 |
| 917.48 | 0.296 |
| 917.65 | 0.298 |
| 917.83 | 0.268 |
| 918.0 | 0.283 |
| 918.18 | 0.279 |
| 918.35 | 0.26 |
| 918.52 | 0.275 |
| 918.7 | 0.251 |
| 918.87 | 0.268 |
| 919.04 | 0.291 |
| 919.22 | 0.283 |
| 919.39 | 0.255 |
| 919.56 | 0.274 |
| 919.74 | 0.291 |
| 919.91 | 0.261 |
| 920.09 | 0.27 |
| 920.26 | 0.279 |
| 920.43 | 0.272 |
| 920.61 | 0.265 |
| 920.78 | 0.263 |
| 920.95 | 0.267 |
| 921.13 | 0.253 |
| 921.3 | 0.266 |
| 921.47 | 0.262 |
| 921.65 | 0.252 |
| 921.82 | 0.272 |
| 921.99 | 0.26 |
| 922.17 | 0.257 |
| 922.34 | 0.265 |
| 922.51 | 0.256 |
| 922.69 | 0.266 |
| 922.86 | 0.252 |
| 923.03 | 0.273 |
| 923.21 | 0.268 |
| 923.38 | 0.267 |
| 923.55 | 0.263 |
| 923.73 | 0.254 |
| 923.9 | 0.268 |
| 924.07 | 0.258 |
| 924.25 | 0.252 |
| 924.42 | 0.23 |
| 924.59 | 0.254 |
| 924.76 | 0.247 |
| 924.94 | 0.243 |
| 925.11 | 0.249 |
| 925.28 | 0.256 |
| 925.46 | 0.253 |
| 925.63 | 0.249 |
| 925.8 | 0.26 |
| 925.98 | 0.258 |
| 926.15 | 0.256 |
| 926.32 | 0.248 |
| 926.49 | 0.254 |
| 926.67 | 0.26 |
| 926.84 | 0.254 |
| 927.01 | 0.243 |
| 927.19 | 0.239 |
| 927.36 | 0.247 |
| 927.53 | 0.251 |
| 927.7 | 0.248 |
| 927.88 | 0.259 |
| 928.05 | 0.25 |
| 928.22 | 0.256 |
| 928.39 | 0.251 |
| 928.57 | 0.23 |
| 928.74 | 0.229 |
| 928.91 | 0.228 |
| 929.08 | 0.226 |
| 929.26 | 0.244 |
| 929.43 | 0.235 |
| 929.6 | 0.24 |
| 929.77 | 0.236 |
| 929.95 | 0.254 |
| 930.12 | 0.237 |
| 930.29 | 0.245 |
| 930.46 | 0.25 |
| 930.64 | 0.219 |
| 930.81 | 0.213 |
| 930.98 | 0.257 |
| 931.15 | 0.264 |
| 931.33 | 0.235 |
| 931.5 | 0.23 |
| 931.67 | 0.273 |
| 931.84 | 0.242 |
| 932.01 | 0.242 |
| 932.19 | 0.252 |
| 932.36 | 0.232 |
| 932.53 | 0.239 |
| 932.7 | 0.238 |
| 932.88 | 0.27 |
| 933.05 | 0.233 |
| 933.22 | 0.256 |
| 933.39 | 0.26 |
| 933.56 | 0.23 |
| 933.74 | 0.232 |
| 933.91 | 0.244 |
| 934.08 | 0.231 |
| 934.25 | 0.238 |
| 934.42 | 0.266 |
| 934.6 | 0.235 |
| 934.77 | 0.226 |
| 934.94 | 0.228 |
| 935.11 | 0.236 |
| 935.28 | 0.248 |
| 935.45 | 0.26 |
| 935.63 | 0.23 |
| 935.8 | 0.242 |
| 935.97 | 0.235 |
| 936.14 | 0.238 |
| 936.31 | 0.236 |
| 936.49 | 0.259 |
| 936.66 | 0.238 |
| 936.83 | 0.251 |
| 937.0 | 0.219 |
| 937.17 | 0.232 |
| 937.34 | 0.246 |
| 937.52 | 0.243 |
| 937.69 | 0.268 |
| 937.86 | 0.238 |
| 938.03 | 0.253 |
| 938.2 | 0.272 |
| 938.37 | 0.258 |
| 938.54 | 0.244 |
| 938.72 | 0.226 |
| 938.89 | 0.229 |
| 939.06 | 0.249 |
| 939.23 | 0.255 |
| 939.4 | 0.269 |
| 939.57 | 0.263 |
| 939.74 | 0.226 |
| 939.92 | 0.245 |
| 940.09 | 0.264 |
| 940.26 | 0.268 |
| 940.43 | 0.266 |
| 940.6 | 0.26 |
| 940.77 | 0.269 |
| 940.94 | 0.237 |
| 941.11 | 0.199 |
| 941.28 | 0.259 |
| 941.46 | 0.234 |
| 941.63 | 0.289 |
| 941.8 | 0.237 |
| 941.97 | 0.226 |
| 942.14 | 0.221 |
| 942.31 | 0.233 |
| 942.48 | 0.246 |
| 942.65 | 0.24 |
| 942.82 | 0.219 |
| 942.99 | 0.27 |
| 943.17 | 0.209 |
| 943.34 | 0.273 |
| 943.51 | 0.253 |
| 943.68 | 0.271 |
| 943.85 | 0.232 |
| 944.02 | 0.198 |
| 944.19 | 0.271 |
| 944.36 | 0.311 |
| 944.53 | 0.268 |
| 944.7 | 0.229 |
| 944.87 | 0.313 |
| 945.04 | 0.258 |
| 945.22 | 0.225 |
| 945.39 | 0.237 |
| 945.56 | 0.282 |
| 945.73 | 0.229 |
| 945.9 | 0.238 |
| 946.07 | 0.293 |
| 946.24 | 0.253 |
| 946.41 | 0.248 |
| 946.58 | 0.207 |
| 946.75 | 0.255 |
| 946.92 | 0.224 |
| 947.09 | 0.209 |
| 947.26 | 0.229 |
| 947.43 | 0.268 |
| 947.6 | 0.216 |
| 947.77 | 0.274 |
| 947.94 | 0.229 |
| 948.11 | 0.261 |
| 948.28 | 0.258 |
| 948.45 | 0.207 |
| 948.62 | 0.28 |
| 948.79 | 0.196 |
| 948.96 | 0.225 |
| 949.14 | 0.275 |
| 949.31 | 0.258 |
| 949.48 | 0.256 |
| 949.65 | 0.213 |
| 949.82 | 0.192 |
| 949.99 | 0.22 |
| 950.16 | 0.231 |
| 950.33 | 0.212 |
| 950.5 | 0.224 |
| 950.67 | 0.239 |
| 950.84 | 0.246 |
| 951.01 | 0.24 |
| 951.18 | 0.254 |
| 951.35 | 0.224 |
| 951.52 | 0.264 |
| 951.69 | 0.26 |
| 951.86 | 0.224 |
| 952.03 | 0.266 |
| 952.2 | 0.254 |
| 952.37 | 0.198 |
| 952.54 | 0.238 |
| 952.7 | 0.253 |
| 952.87 | 0.232 |
| 953.04 | 0.236 |
| 953.21 | 0.267 |
| 953.38 | 0.215 |
| 953.55 | 0.247 |
| 953.72 | 0.26 |
| 953.89 | 0.265 |
| 954.06 | 0.198 |
| 954.23 | 0.295 |
| 954.4 | 0.272 |
| 954.57 | 0.261 |
| 954.74 | 0.23 |
| 954.91 | 0.26 |
| 955.08 | 0.178 |
| 955.25 | 0.278 |
| 955.42 | 0.229 |
| 955.59 | 0.219 |
| 955.76 | 0.253 |
| 955.93 | 0.231 |
| 956.1 | 0.256 |
| 956.27 | 0.237 |
| 956.43 | 0.255 |
| 956.6 | 0.238 |
| 956.77 | 0.208 |
| 956.94 | 0.3 |
| 957.11 | 0.215 |
| 957.28 | 0.266 |
| 957.45 | 0.283 |
| 957.62 | 0.282 |
| 957.79 | 0.261 |
| 957.96 | 0.259 |
| 958.13 | 0.247 |
| 958.3 | 0.286 |
| 958.47 | 0.263 |
| 958.63 | 0.217 |
| 958.8 | 0.216 |
| 958.97 | 0.283 |
| 959.14 | 0.241 |
| 959.31 | 0.233 |
| 959.48 | 0.218 |
| 959.65 | 0.252 |
| 959.82 | 0.27 |
| 959.99 | 0.224 |
| 960.16 | 0.247 |
| 960.32 | 0.212 |
| 960.49 | 0.266 |
| 960.66 | 0.243 |
| 960.83 | 0.208 |
| 961.0 | 0.225 |
| 961.17 | 0.242 |
| 961.34 | 0.264 |
| 961.51 | 0.194 |
| 961.67 | 0.233 |
| 961.84 | 0.285 |
| 962.01 | 0.26 |
| 962.18 | 0.275 |
| 962.35 | 0.239 |
| 962.52 | 0.292 |
| 962.69 | 0.241 |
| 962.85 | 0.247 |
| 963.02 | 0.282 |
| 963.19 | 0.269 |
| 963.36 | 0.243 |
| 963.53 | 0.315 |
| 963.7 | 0.211 |
| 963.87 | 0.284 |
| 964.03 | 0.269 |
| 964.2 | 0.258 |
| 964.37 | 0.213 |
| 964.54 | 0.248 |
| 964.71 | 0.278 |
| 964.88 | 0.223 |
| 965.04 | 0.236 |
| 965.21 | 0.272 |
| 965.38 | 0.254 |
| 965.55 | 0.25 |
| 965.72 | 0.23 |
| 965.88 | 0.209 |
| 966.05 | 0.264 |
| 966.22 | 0.279 |
| 966.39 | 0.265 |
| 966.56 | 0.256 |
| 966.73 | 0.26 |
| 966.89 | 0.259 |
| 967.06 | 0.258 |
| 967.23 | 0.237 |
| 967.4 | 0.221 |
| 967.57 | 0.245 |
| 967.73 | 0.277 |
| 967.9 | 0.224 |
| 968.07 | 0.245 |
| 968.24 | 0.221 |
| 968.41 | 0.232 |
| 968.57 | 0.228 |
| 968.74 | 0.299 |
| 968.91 | 0.266 |
| 969.08 | 0.328 |
| 969.24 | 0.282 |
| 969.41 | 0.26 |
| 969.58 | 0.217 |
| 969.75 | 0.298 |
| 969.92 | 0.291 |
| 970.08 | 0.211 |
| 970.25 | 0.273 |
| 970.42 | 0.273 |
| 970.59 | 0.246 |
| 970.75 | 0.207 |
| 970.92 | 0.21 |
| 971.09 | 0.304 |
| 971.26 | 0.288 |
| 971.42 | 0.239 |
| 971.59 | 0.237 |
| 971.76 | 0.266 |
| 971.93 | 0.234 |
| 972.09 | 0.239 |
| 972.26 | 0.304 |
| 972.43 | 0.254 |
| 972.6 | 0.225 |
| 972.76 | 0.266 |
| 972.93 | 0.314 |
| 973.1 | 0.248 |
| 973.26 | 0.281 |
| 973.43 | 0.22 |
| 973.6 | 0.23 |
| 973.77 | 0.307 |
| 973.93 | 0.322 |
| 974.1 | 0.291 |
| 974.27 | 0.266 |
| 974.44 | 0.304 |
| 974.6 | 0.234 |
| 974.77 | 0.327 |
| 974.94 | 0.259 |
| 975.1 | 0.213 |
| 975.27 | 0.22 |
| 975.44 | 0.293 |
| 975.6 | 0.222 |
| 975.77 | 0.262 |
| 975.94 | 0.151 |
| 976.11 | 0.295 |
| 976.27 | 0.26 |
| 976.44 | 0.299 |
| 976.61 | 0.25 |
| 976.77 | 0.321 |
| 976.94 | 0.267 |
| 977.11 | 0.269 |
| 977.27 | 0.264 |
| 977.44 | 0.219 |
| 977.61 | 0.287 |
| 977.77 | 0.327 |
| 977.94 | 0.275 |
| 978.11 | 0.247 |
| 978.27 | 0.301 |
| 978.44 | 0.305 |
| 978.61 | 0.278 |
| 978.77 | 0.365 |
| 978.94 | 0.272 |
| 979.11 | 0.287 |
| 979.27 | 0.307 |
| 979.44 | 0.245 |
| 979.61 | 0.306 |
| 979.77 | 0.363 |
| 979.94 | 0.326 |
| 980.11 | 0.253 |
| 980.27 | 0.318 |
| 980.44 | 0.307 |
| 980.6 | 0.266 |
| 980.77 | 0.376 |
| 980.94 | 0.27 |
| 981.1 | 0.32 |
| 981.27 | 0.272 |
| 981.44 | 0.308 |
| 981.6 | 0.215 |
| 981.77 | 0.22 |
| 981.93 | 0.347 |
| 982.1 | 0.284 |
| 982.27 | 0.316 |
| 982.43 | 0.298 |
| 982.6 | 0.26 |
| 982.76 | 0.283 |
| 982.93 | 0.262 |
| 983.1 | 0.322 |
| 983.26 | 0.342 |
| 983.43 | 0.27 |
| 983.6 | 0.33 |
| 983.76 | 0.333 |
| 983.93 | 0.276 |
| 984.09 | 0.251 |
| 984.26 | 0.202 |
| 984.42 | 0.304 |
| 984.59 | 0.31 |
| 984.76 | 0.301 |
| 984.92 | 0.284 |
| 985.09 | 0.294 |
| 985.25 | 0.312 |
| 985.42 | 0.367 |
| 985.59 | 0.324 |
| 985.75 | 0.299 |
| 985.92 | 0.288 |
| 986.08 | 0.327 |
| 986.25 | 0.313 |
| 986.41 | 0.342 |
| 986.58 | 0.325 |
| 986.74 | 0.322 |
| 986.91 | 0.353 |
| 987.08 | 0.341 |
| 987.24 | 0.373 |
| 987.41 | 0.314 |
| 987.57 | 0.26 |
| 987.74 | 0.288 |
| 987.9 | 0.294 |
| 988.07 | 0.252 |
| 988.23 | 0.274 |
| 988.4 | 0.359 |
| 988.56 | 0.329 |
| 988.73 | 0.317 |
| 988.9 | 0.276 |
| 989.06 | 0.289 |
| 989.23 | 0.321 |
| 989.39 | 0.276 |
| 989.56 | 0.362 |
| 989.72 | 0.296 |
| 989.89 | 0.345 |
| 990.05 | 0.294 |
| 990.22 | 0.269 |
| 990.38 | 0.264 |
| 990.55 | 0.233 |
| 990.71 | 0.254 |
| 990.88 | 0.276 |
| 991.04 | 0.352 |
| 991.21 | 0.279 |
| 991.37 | 0.265 |
| 991.54 | 0.292 |
| 991.7 | 0.324 |
| 991.87 | 0.348 |
| 992.03 | 0.324 |
| 992.2 | 0.365 |
| 992.36 | 0.324 |
| 992.53 | 0.392 |
| 992.69 | 0.33 |
| 992.86 | 0.299 |
| 993.02 | 0.319 |
| 993.19 | 0.268 |
| 993.35 | 0.326 |
| 993.52 | 0.286 |
| 993.68 | 0.334 |
| 993.84 | 0.38 |
| 994.01 | 0.325 |
| 994.17 | 0.397 |
| 994.34 | 0.365 |
| 994.5 | 0.287 |
| 994.67 | 0.252 |
| 994.83 | 0.331 |
| 995.0 | 0.453 |
| 995.16 | 0.36 |
| 995.33 | 0.281 |
| 995.49 | 0.346 |
| 995.65 | 0.294 |
| 995.82 | 0.244 |
| 995.98 | 0.239 |
| 996.15 | 0.328 |
| 996.31 | 0.296 |
| 996.48 | 0.264 |
| 996.64 | 0.36 |
| 996.81 | 0.262 |
| 996.97 | 0.337 |
| 997.13 | 0.315 |
| 997.3 | 0.303 |
| 997.46 | 0.301 |
| 997.63 | 0.412 |
| 997.79 | 0.265 |
| 997.95 | 0.446 |
| 998.12 | 0.346 |
| 998.28 | 0.417 |
| 998.45 | 0.371 |
| 998.61 | 0.364 |
| 998.77 | 0.377 |
| 998.94 | 0.319 |
| 999.1 | 0.294 |
| 999.27 | 0.361 |
| 999.43 | 0.347 |
| 999.59 | 0.446 |
| 999.76 | 0.338 |
| 999.92 | 0.373 |
| 1000.09 | 0.329 |